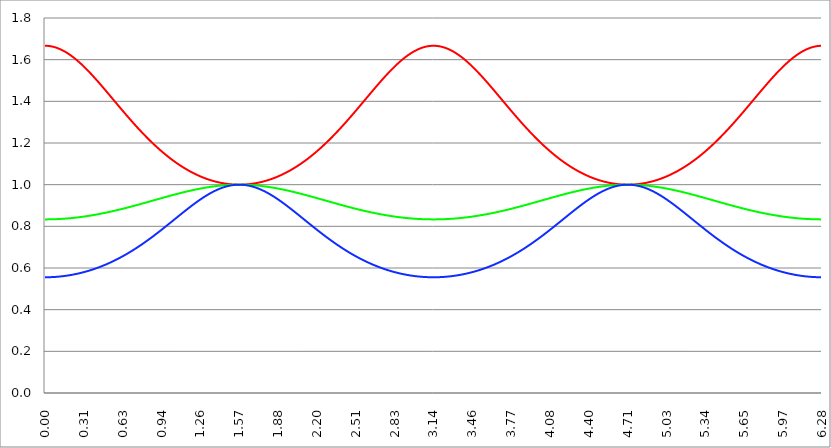
| Category | Series 1 | Series 0 | Series 2 |
|---|---|---|---|
| 0.0 | 1.667 | 0.833 | 0.556 |
| 0.00314159265358979 | 1.667 | 0.833 | 0.556 |
| 0.00628318530717958 | 1.667 | 0.833 | 0.556 |
| 0.00942477796076938 | 1.667 | 0.833 | 0.556 |
| 0.0125663706143592 | 1.666 | 0.833 | 0.556 |
| 0.015707963267949 | 1.666 | 0.833 | 0.556 |
| 0.0188495559215388 | 1.666 | 0.833 | 0.556 |
| 0.0219911485751285 | 1.666 | 0.833 | 0.556 |
| 0.0251327412287183 | 1.666 | 0.833 | 0.556 |
| 0.0282743338823081 | 1.666 | 0.833 | 0.556 |
| 0.0314159265358979 | 1.666 | 0.833 | 0.556 |
| 0.0345575191894877 | 1.665 | 0.833 | 0.556 |
| 0.0376991118430775 | 1.665 | 0.834 | 0.556 |
| 0.0408407044966673 | 1.665 | 0.834 | 0.556 |
| 0.0439822971502571 | 1.665 | 0.834 | 0.556 |
| 0.0471238898038469 | 1.664 | 0.834 | 0.556 |
| 0.0502654824574367 | 1.664 | 0.834 | 0.556 |
| 0.0534070751110265 | 1.664 | 0.834 | 0.556 |
| 0.0565486677646163 | 1.663 | 0.834 | 0.556 |
| 0.059690260418206 | 1.663 | 0.834 | 0.556 |
| 0.0628318530717958 | 1.662 | 0.834 | 0.557 |
| 0.0659734457253856 | 1.662 | 0.834 | 0.557 |
| 0.0691150383789754 | 1.661 | 0.834 | 0.557 |
| 0.0722566310325652 | 1.661 | 0.834 | 0.557 |
| 0.075398223686155 | 1.66 | 0.834 | 0.557 |
| 0.0785398163397448 | 1.66 | 0.834 | 0.557 |
| 0.0816814089933346 | 1.659 | 0.834 | 0.557 |
| 0.0848230016469244 | 1.659 | 0.834 | 0.557 |
| 0.0879645943005142 | 1.658 | 0.834 | 0.557 |
| 0.091106186954104 | 1.658 | 0.834 | 0.558 |
| 0.0942477796076937 | 1.657 | 0.835 | 0.558 |
| 0.0973893722612835 | 1.656 | 0.835 | 0.558 |
| 0.100530964914873 | 1.656 | 0.835 | 0.558 |
| 0.103672557568463 | 1.655 | 0.835 | 0.558 |
| 0.106814150222053 | 1.654 | 0.835 | 0.558 |
| 0.109955742875643 | 1.653 | 0.835 | 0.559 |
| 0.113097335529233 | 1.653 | 0.835 | 0.559 |
| 0.116238928182822 | 1.652 | 0.835 | 0.559 |
| 0.119380520836412 | 1.651 | 0.835 | 0.559 |
| 0.122522113490002 | 1.65 | 0.835 | 0.559 |
| 0.125663706143592 | 1.649 | 0.836 | 0.559 |
| 0.128805298797181 | 1.649 | 0.836 | 0.56 |
| 0.131946891450771 | 1.648 | 0.836 | 0.56 |
| 0.135088484104361 | 1.647 | 0.836 | 0.56 |
| 0.138230076757951 | 1.646 | 0.836 | 0.56 |
| 0.141371669411541 | 1.645 | 0.836 | 0.561 |
| 0.14451326206513 | 1.644 | 0.836 | 0.561 |
| 0.14765485471872 | 1.643 | 0.836 | 0.561 |
| 0.15079644737231 | 1.642 | 0.836 | 0.561 |
| 0.1539380400259 | 1.641 | 0.837 | 0.561 |
| 0.15707963267949 | 1.64 | 0.837 | 0.562 |
| 0.160221225333079 | 1.639 | 0.837 | 0.562 |
| 0.163362817986669 | 1.638 | 0.837 | 0.562 |
| 0.166504410640259 | 1.637 | 0.837 | 0.562 |
| 0.169646003293849 | 1.636 | 0.837 | 0.563 |
| 0.172787595947439 | 1.634 | 0.837 | 0.563 |
| 0.175929188601028 | 1.633 | 0.838 | 0.563 |
| 0.179070781254618 | 1.632 | 0.838 | 0.564 |
| 0.182212373908208 | 1.631 | 0.838 | 0.564 |
| 0.185353966561798 | 1.63 | 0.838 | 0.564 |
| 0.188495559215388 | 1.629 | 0.838 | 0.564 |
| 0.191637151868977 | 1.627 | 0.838 | 0.565 |
| 0.194778744522567 | 1.626 | 0.839 | 0.565 |
| 0.197920337176157 | 1.625 | 0.839 | 0.565 |
| 0.201061929829747 | 1.623 | 0.839 | 0.566 |
| 0.204203522483336 | 1.622 | 0.839 | 0.566 |
| 0.207345115136926 | 1.621 | 0.839 | 0.566 |
| 0.210486707790516 | 1.62 | 0.839 | 0.567 |
| 0.213628300444106 | 1.618 | 0.84 | 0.567 |
| 0.216769893097696 | 1.617 | 0.84 | 0.567 |
| 0.219911485751285 | 1.615 | 0.84 | 0.568 |
| 0.223053078404875 | 1.614 | 0.84 | 0.568 |
| 0.226194671058465 | 1.613 | 0.84 | 0.568 |
| 0.229336263712055 | 1.611 | 0.841 | 0.569 |
| 0.232477856365645 | 1.61 | 0.841 | 0.569 |
| 0.235619449019234 | 1.608 | 0.841 | 0.569 |
| 0.238761041672824 | 1.607 | 0.841 | 0.57 |
| 0.241902634326414 | 1.605 | 0.841 | 0.57 |
| 0.245044226980004 | 1.604 | 0.842 | 0.57 |
| 0.248185819633594 | 1.602 | 0.842 | 0.571 |
| 0.251327412287183 | 1.601 | 0.842 | 0.571 |
| 0.254469004940773 | 1.599 | 0.842 | 0.572 |
| 0.257610597594363 | 1.598 | 0.842 | 0.572 |
| 0.260752190247953 | 1.596 | 0.843 | 0.572 |
| 0.263893782901543 | 1.594 | 0.843 | 0.573 |
| 0.267035375555132 | 1.593 | 0.843 | 0.573 |
| 0.270176968208722 | 1.591 | 0.843 | 0.574 |
| 0.273318560862312 | 1.589 | 0.844 | 0.574 |
| 0.276460153515902 | 1.588 | 0.844 | 0.575 |
| 0.279601746169492 | 1.586 | 0.844 | 0.575 |
| 0.282743338823082 | 1.584 | 0.844 | 0.575 |
| 0.285884931476671 | 1.583 | 0.845 | 0.576 |
| 0.289026524130261 | 1.581 | 0.845 | 0.576 |
| 0.292168116783851 | 1.579 | 0.845 | 0.577 |
| 0.295309709437441 | 1.578 | 0.845 | 0.577 |
| 0.298451302091031 | 1.576 | 0.846 | 0.578 |
| 0.30159289474462 | 1.574 | 0.846 | 0.578 |
| 0.30473448739821 | 1.572 | 0.846 | 0.579 |
| 0.3078760800518 | 1.571 | 0.846 | 0.579 |
| 0.31101767270539 | 1.569 | 0.847 | 0.58 |
| 0.31415926535898 | 1.567 | 0.847 | 0.58 |
| 0.31730085801257 | 1.565 | 0.847 | 0.581 |
| 0.320442450666159 | 1.563 | 0.847 | 0.581 |
| 0.323584043319749 | 1.561 | 0.848 | 0.582 |
| 0.326725635973339 | 1.56 | 0.848 | 0.582 |
| 0.329867228626929 | 1.558 | 0.848 | 0.583 |
| 0.333008821280519 | 1.556 | 0.848 | 0.583 |
| 0.336150413934108 | 1.554 | 0.849 | 0.584 |
| 0.339292006587698 | 1.552 | 0.849 | 0.584 |
| 0.342433599241288 | 1.55 | 0.849 | 0.585 |
| 0.345575191894878 | 1.548 | 0.85 | 0.585 |
| 0.348716784548468 | 1.546 | 0.85 | 0.586 |
| 0.351858377202058 | 1.544 | 0.85 | 0.587 |
| 0.354999969855647 | 1.542 | 0.85 | 0.587 |
| 0.358141562509237 | 1.54 | 0.851 | 0.588 |
| 0.361283155162827 | 1.539 | 0.851 | 0.588 |
| 0.364424747816417 | 1.537 | 0.851 | 0.589 |
| 0.367566340470007 | 1.535 | 0.852 | 0.589 |
| 0.370707933123597 | 1.533 | 0.852 | 0.59 |
| 0.373849525777186 | 1.531 | 0.852 | 0.591 |
| 0.376991118430776 | 1.529 | 0.853 | 0.591 |
| 0.380132711084366 | 1.527 | 0.853 | 0.592 |
| 0.383274303737956 | 1.525 | 0.853 | 0.592 |
| 0.386415896391546 | 1.523 | 0.854 | 0.593 |
| 0.389557489045135 | 1.52 | 0.854 | 0.594 |
| 0.392699081698725 | 1.518 | 0.854 | 0.594 |
| 0.395840674352315 | 1.516 | 0.855 | 0.595 |
| 0.398982267005905 | 1.514 | 0.855 | 0.595 |
| 0.402123859659495 | 1.512 | 0.855 | 0.596 |
| 0.405265452313085 | 1.51 | 0.855 | 0.597 |
| 0.408407044966674 | 1.508 | 0.856 | 0.597 |
| 0.411548637620264 | 1.506 | 0.856 | 0.598 |
| 0.414690230273854 | 1.504 | 0.857 | 0.599 |
| 0.417831822927444 | 1.502 | 0.857 | 0.599 |
| 0.420973415581034 | 1.5 | 0.857 | 0.6 |
| 0.424115008234623 | 1.498 | 0.858 | 0.601 |
| 0.427256600888213 | 1.495 | 0.858 | 0.601 |
| 0.430398193541803 | 1.493 | 0.858 | 0.602 |
| 0.433539786195393 | 1.491 | 0.859 | 0.603 |
| 0.436681378848983 | 1.489 | 0.859 | 0.604 |
| 0.439822971502573 | 1.487 | 0.859 | 0.604 |
| 0.442964564156162 | 1.485 | 0.86 | 0.605 |
| 0.446106156809752 | 1.483 | 0.86 | 0.606 |
| 0.449247749463342 | 1.481 | 0.86 | 0.606 |
| 0.452389342116932 | 1.478 | 0.861 | 0.607 |
| 0.455530934770522 | 1.476 | 0.861 | 0.608 |
| 0.458672527424111 | 1.474 | 0.861 | 0.609 |
| 0.461814120077701 | 1.472 | 0.862 | 0.609 |
| 0.464955712731291 | 1.47 | 0.862 | 0.61 |
| 0.468097305384881 | 1.468 | 0.863 | 0.611 |
| 0.471238898038471 | 1.465 | 0.863 | 0.612 |
| 0.474380490692061 | 1.463 | 0.863 | 0.612 |
| 0.47752208334565 | 1.461 | 0.864 | 0.613 |
| 0.48066367599924 | 1.459 | 0.864 | 0.614 |
| 0.48380526865283 | 1.457 | 0.865 | 0.615 |
| 0.48694686130642 | 1.454 | 0.865 | 0.615 |
| 0.49008845396001 | 1.452 | 0.865 | 0.616 |
| 0.493230046613599 | 1.45 | 0.866 | 0.617 |
| 0.496371639267189 | 1.448 | 0.866 | 0.618 |
| 0.499513231920779 | 1.446 | 0.866 | 0.619 |
| 0.502654824574369 | 1.443 | 0.867 | 0.619 |
| 0.505796417227959 | 1.441 | 0.867 | 0.62 |
| 0.508938009881549 | 1.439 | 0.868 | 0.621 |
| 0.512079602535138 | 1.437 | 0.868 | 0.622 |
| 0.515221195188728 | 1.434 | 0.868 | 0.623 |
| 0.518362787842318 | 1.432 | 0.869 | 0.624 |
| 0.521504380495908 | 1.43 | 0.869 | 0.624 |
| 0.524645973149498 | 1.428 | 0.87 | 0.625 |
| 0.527787565803087 | 1.426 | 0.87 | 0.626 |
| 0.530929158456677 | 1.423 | 0.871 | 0.627 |
| 0.534070751110267 | 1.421 | 0.871 | 0.628 |
| 0.537212343763857 | 1.419 | 0.871 | 0.629 |
| 0.540353936417447 | 1.417 | 0.872 | 0.63 |
| 0.543495529071037 | 1.414 | 0.872 | 0.63 |
| 0.546637121724626 | 1.412 | 0.873 | 0.631 |
| 0.549778714378216 | 1.41 | 0.873 | 0.632 |
| 0.552920307031806 | 1.408 | 0.873 | 0.633 |
| 0.556061899685396 | 1.406 | 0.874 | 0.634 |
| 0.559203492338986 | 1.403 | 0.874 | 0.635 |
| 0.562345084992576 | 1.401 | 0.875 | 0.636 |
| 0.565486677646165 | 1.399 | 0.875 | 0.637 |
| 0.568628270299755 | 1.397 | 0.876 | 0.638 |
| 0.571769862953345 | 1.394 | 0.876 | 0.639 |
| 0.574911455606935 | 1.392 | 0.877 | 0.64 |
| 0.578053048260525 | 1.39 | 0.877 | 0.641 |
| 0.581194640914114 | 1.388 | 0.877 | 0.641 |
| 0.584336233567704 | 1.386 | 0.878 | 0.642 |
| 0.587477826221294 | 1.383 | 0.878 | 0.643 |
| 0.590619418874884 | 1.381 | 0.879 | 0.644 |
| 0.593761011528474 | 1.379 | 0.879 | 0.645 |
| 0.596902604182064 | 1.377 | 0.88 | 0.646 |
| 0.600044196835653 | 1.374 | 0.88 | 0.647 |
| 0.603185789489243 | 1.372 | 0.881 | 0.648 |
| 0.606327382142833 | 1.37 | 0.881 | 0.649 |
| 0.609468974796423 | 1.368 | 0.881 | 0.65 |
| 0.612610567450013 | 1.366 | 0.882 | 0.651 |
| 0.615752160103602 | 1.363 | 0.882 | 0.652 |
| 0.618893752757192 | 1.361 | 0.883 | 0.653 |
| 0.622035345410782 | 1.359 | 0.883 | 0.654 |
| 0.625176938064372 | 1.357 | 0.884 | 0.655 |
| 0.628318530717962 | 1.355 | 0.884 | 0.656 |
| 0.631460123371551 | 1.352 | 0.885 | 0.657 |
| 0.634601716025141 | 1.35 | 0.885 | 0.658 |
| 0.637743308678731 | 1.348 | 0.886 | 0.659 |
| 0.640884901332321 | 1.346 | 0.886 | 0.66 |
| 0.644026493985911 | 1.344 | 0.887 | 0.662 |
| 0.647168086639501 | 1.342 | 0.887 | 0.663 |
| 0.65030967929309 | 1.339 | 0.888 | 0.664 |
| 0.65345127194668 | 1.337 | 0.888 | 0.665 |
| 0.65659286460027 | 1.335 | 0.889 | 0.666 |
| 0.65973445725386 | 1.333 | 0.889 | 0.667 |
| 0.66287604990745 | 1.331 | 0.889 | 0.668 |
| 0.666017642561039 | 1.329 | 0.89 | 0.669 |
| 0.669159235214629 | 1.326 | 0.89 | 0.67 |
| 0.672300827868219 | 1.324 | 0.891 | 0.671 |
| 0.675442420521809 | 1.322 | 0.891 | 0.672 |
| 0.678584013175399 | 1.32 | 0.892 | 0.673 |
| 0.681725605828989 | 1.318 | 0.892 | 0.675 |
| 0.684867198482578 | 1.316 | 0.893 | 0.676 |
| 0.688008791136168 | 1.314 | 0.893 | 0.677 |
| 0.691150383789758 | 1.311 | 0.894 | 0.678 |
| 0.694291976443348 | 1.309 | 0.894 | 0.679 |
| 0.697433569096938 | 1.307 | 0.895 | 0.68 |
| 0.700575161750528 | 1.305 | 0.895 | 0.681 |
| 0.703716754404117 | 1.303 | 0.896 | 0.683 |
| 0.706858347057707 | 1.301 | 0.896 | 0.684 |
| 0.709999939711297 | 1.299 | 0.897 | 0.685 |
| 0.713141532364887 | 1.297 | 0.897 | 0.686 |
| 0.716283125018477 | 1.295 | 0.898 | 0.687 |
| 0.719424717672066 | 1.293 | 0.898 | 0.688 |
| 0.722566310325656 | 1.29 | 0.899 | 0.69 |
| 0.725707902979246 | 1.288 | 0.899 | 0.691 |
| 0.728849495632836 | 1.286 | 0.9 | 0.692 |
| 0.731991088286426 | 1.284 | 0.9 | 0.693 |
| 0.735132680940016 | 1.282 | 0.901 | 0.694 |
| 0.738274273593605 | 1.28 | 0.901 | 0.696 |
| 0.741415866247195 | 1.278 | 0.902 | 0.697 |
| 0.744557458900785 | 1.276 | 0.902 | 0.698 |
| 0.747699051554375 | 1.274 | 0.903 | 0.699 |
| 0.750840644207965 | 1.272 | 0.903 | 0.7 |
| 0.753982236861554 | 1.27 | 0.904 | 0.702 |
| 0.757123829515144 | 1.268 | 0.904 | 0.703 |
| 0.760265422168734 | 1.266 | 0.905 | 0.704 |
| 0.763407014822324 | 1.264 | 0.905 | 0.705 |
| 0.766548607475914 | 1.262 | 0.906 | 0.707 |
| 0.769690200129504 | 1.26 | 0.907 | 0.708 |
| 0.772831792783093 | 1.258 | 0.907 | 0.709 |
| 0.775973385436683 | 1.256 | 0.908 | 0.71 |
| 0.779114978090273 | 1.254 | 0.908 | 0.712 |
| 0.782256570743863 | 1.252 | 0.909 | 0.713 |
| 0.785398163397453 | 1.25 | 0.909 | 0.714 |
| 0.788539756051042 | 1.248 | 0.91 | 0.716 |
| 0.791681348704632 | 1.246 | 0.91 | 0.717 |
| 0.794822941358222 | 1.244 | 0.911 | 0.718 |
| 0.797964534011812 | 1.242 | 0.911 | 0.719 |
| 0.801106126665402 | 1.24 | 0.912 | 0.721 |
| 0.804247719318992 | 1.238 | 0.912 | 0.722 |
| 0.807389311972581 | 1.236 | 0.913 | 0.723 |
| 0.810530904626171 | 1.234 | 0.913 | 0.725 |
| 0.813672497279761 | 1.233 | 0.914 | 0.726 |
| 0.816814089933351 | 1.231 | 0.914 | 0.727 |
| 0.819955682586941 | 1.229 | 0.915 | 0.729 |
| 0.823097275240531 | 1.227 | 0.915 | 0.73 |
| 0.82623886789412 | 1.225 | 0.916 | 0.731 |
| 0.82938046054771 | 1.223 | 0.916 | 0.733 |
| 0.8325220532013 | 1.221 | 0.917 | 0.734 |
| 0.83566364585489 | 1.219 | 0.917 | 0.735 |
| 0.83880523850848 | 1.218 | 0.918 | 0.737 |
| 0.841946831162069 | 1.216 | 0.919 | 0.738 |
| 0.845088423815659 | 1.214 | 0.919 | 0.739 |
| 0.848230016469249 | 1.212 | 0.92 | 0.741 |
| 0.851371609122839 | 1.21 | 0.92 | 0.742 |
| 0.854513201776429 | 1.208 | 0.921 | 0.744 |
| 0.857654794430019 | 1.207 | 0.921 | 0.745 |
| 0.860796387083608 | 1.205 | 0.922 | 0.746 |
| 0.863937979737198 | 1.203 | 0.922 | 0.748 |
| 0.867079572390788 | 1.201 | 0.923 | 0.749 |
| 0.870221165044378 | 1.199 | 0.923 | 0.75 |
| 0.873362757697968 | 1.198 | 0.924 | 0.752 |
| 0.876504350351557 | 1.196 | 0.924 | 0.753 |
| 0.879645943005147 | 1.194 | 0.925 | 0.755 |
| 0.882787535658737 | 1.192 | 0.925 | 0.756 |
| 0.885929128312327 | 1.191 | 0.926 | 0.758 |
| 0.889070720965917 | 1.189 | 0.926 | 0.759 |
| 0.892212313619507 | 1.187 | 0.927 | 0.76 |
| 0.895353906273096 | 1.185 | 0.927 | 0.762 |
| 0.898495498926686 | 1.184 | 0.928 | 0.763 |
| 0.901637091580276 | 1.182 | 0.929 | 0.765 |
| 0.904778684233866 | 1.18 | 0.929 | 0.766 |
| 0.907920276887456 | 1.179 | 0.93 | 0.767 |
| 0.911061869541045 | 1.177 | 0.93 | 0.769 |
| 0.914203462194635 | 1.175 | 0.931 | 0.77 |
| 0.917345054848225 | 1.173 | 0.931 | 0.772 |
| 0.920486647501815 | 1.172 | 0.932 | 0.773 |
| 0.923628240155405 | 1.17 | 0.932 | 0.775 |
| 0.926769832808995 | 1.168 | 0.933 | 0.776 |
| 0.929911425462584 | 1.167 | 0.933 | 0.778 |
| 0.933053018116174 | 1.165 | 0.934 | 0.779 |
| 0.936194610769764 | 1.164 | 0.934 | 0.781 |
| 0.939336203423354 | 1.162 | 0.935 | 0.782 |
| 0.942477796076944 | 1.16 | 0.935 | 0.783 |
| 0.945619388730533 | 1.159 | 0.936 | 0.785 |
| 0.948760981384123 | 1.157 | 0.936 | 0.786 |
| 0.951902574037713 | 1.156 | 0.937 | 0.788 |
| 0.955044166691303 | 1.154 | 0.937 | 0.789 |
| 0.958185759344893 | 1.152 | 0.938 | 0.791 |
| 0.961327351998483 | 1.151 | 0.938 | 0.792 |
| 0.964468944652072 | 1.149 | 0.939 | 0.794 |
| 0.967610537305662 | 1.148 | 0.94 | 0.795 |
| 0.970752129959252 | 1.146 | 0.94 | 0.797 |
| 0.973893722612842 | 1.145 | 0.941 | 0.798 |
| 0.977035315266432 | 1.143 | 0.941 | 0.8 |
| 0.980176907920022 | 1.142 | 0.942 | 0.801 |
| 0.983318500573611 | 1.14 | 0.942 | 0.803 |
| 0.986460093227201 | 1.139 | 0.943 | 0.804 |
| 0.989601685880791 | 1.137 | 0.943 | 0.806 |
| 0.992743278534381 | 1.136 | 0.944 | 0.807 |
| 0.995884871187971 | 1.134 | 0.944 | 0.809 |
| 0.99902646384156 | 1.133 | 0.945 | 0.81 |
| 1.00216805649515 | 1.131 | 0.945 | 0.812 |
| 1.00530964914874 | 1.13 | 0.946 | 0.813 |
| 1.00845124180233 | 1.128 | 0.946 | 0.815 |
| 1.01159283445592 | 1.127 | 0.947 | 0.816 |
| 1.01473442710951 | 1.125 | 0.947 | 0.818 |
| 1.017876019763099 | 1.124 | 0.948 | 0.819 |
| 1.021017612416689 | 1.123 | 0.948 | 0.821 |
| 1.02415920507028 | 1.121 | 0.949 | 0.822 |
| 1.027300797723869 | 1.12 | 0.949 | 0.824 |
| 1.030442390377459 | 1.118 | 0.95 | 0.825 |
| 1.033583983031048 | 1.117 | 0.95 | 0.827 |
| 1.036725575684638 | 1.116 | 0.951 | 0.828 |
| 1.039867168338228 | 1.114 | 0.951 | 0.83 |
| 1.043008760991818 | 1.113 | 0.952 | 0.831 |
| 1.046150353645408 | 1.112 | 0.952 | 0.833 |
| 1.049291946298998 | 1.11 | 0.953 | 0.834 |
| 1.052433538952587 | 1.109 | 0.953 | 0.836 |
| 1.055575131606177 | 1.108 | 0.954 | 0.837 |
| 1.058716724259767 | 1.106 | 0.954 | 0.839 |
| 1.061858316913357 | 1.105 | 0.955 | 0.84 |
| 1.064999909566947 | 1.104 | 0.955 | 0.842 |
| 1.068141502220536 | 1.102 | 0.956 | 0.843 |
| 1.071283094874126 | 1.101 | 0.956 | 0.845 |
| 1.074424687527716 | 1.1 | 0.957 | 0.846 |
| 1.077566280181306 | 1.099 | 0.957 | 0.848 |
| 1.080707872834896 | 1.097 | 0.958 | 0.849 |
| 1.083849465488486 | 1.096 | 0.958 | 0.851 |
| 1.086991058142075 | 1.095 | 0.959 | 0.852 |
| 1.090132650795665 | 1.094 | 0.959 | 0.854 |
| 1.093274243449255 | 1.092 | 0.959 | 0.855 |
| 1.096415836102845 | 1.091 | 0.96 | 0.857 |
| 1.099557428756435 | 1.09 | 0.96 | 0.858 |
| 1.102699021410025 | 1.089 | 0.961 | 0.86 |
| 1.105840614063614 | 1.087 | 0.961 | 0.861 |
| 1.108982206717204 | 1.086 | 0.962 | 0.863 |
| 1.112123799370794 | 1.085 | 0.962 | 0.864 |
| 1.115265392024384 | 1.084 | 0.963 | 0.866 |
| 1.118406984677974 | 1.083 | 0.963 | 0.867 |
| 1.121548577331563 | 1.082 | 0.964 | 0.869 |
| 1.124690169985153 | 1.08 | 0.964 | 0.87 |
| 1.127831762638743 | 1.079 | 0.965 | 0.872 |
| 1.130973355292333 | 1.078 | 0.965 | 0.873 |
| 1.134114947945923 | 1.077 | 0.965 | 0.875 |
| 1.137256540599513 | 1.076 | 0.966 | 0.876 |
| 1.140398133253102 | 1.075 | 0.966 | 0.878 |
| 1.143539725906692 | 1.074 | 0.967 | 0.879 |
| 1.146681318560282 | 1.073 | 0.967 | 0.881 |
| 1.149822911213872 | 1.072 | 0.968 | 0.882 |
| 1.152964503867462 | 1.071 | 0.968 | 0.884 |
| 1.156106096521051 | 1.069 | 0.969 | 0.885 |
| 1.159247689174641 | 1.068 | 0.969 | 0.887 |
| 1.162389281828231 | 1.067 | 0.969 | 0.888 |
| 1.165530874481821 | 1.066 | 0.97 | 0.889 |
| 1.168672467135411 | 1.065 | 0.97 | 0.891 |
| 1.171814059789001 | 1.064 | 0.971 | 0.892 |
| 1.17495565244259 | 1.063 | 0.971 | 0.894 |
| 1.17809724509618 | 1.062 | 0.972 | 0.895 |
| 1.18123883774977 | 1.061 | 0.972 | 0.897 |
| 1.18438043040336 | 1.06 | 0.972 | 0.898 |
| 1.18752202305695 | 1.059 | 0.973 | 0.899 |
| 1.190663615710539 | 1.058 | 0.973 | 0.901 |
| 1.193805208364129 | 1.057 | 0.974 | 0.902 |
| 1.19694680101772 | 1.056 | 0.974 | 0.904 |
| 1.200088393671309 | 1.055 | 0.974 | 0.905 |
| 1.203229986324899 | 1.054 | 0.975 | 0.906 |
| 1.206371578978489 | 1.054 | 0.975 | 0.908 |
| 1.209513171632078 | 1.053 | 0.976 | 0.909 |
| 1.212654764285668 | 1.052 | 0.976 | 0.91 |
| 1.215796356939258 | 1.051 | 0.976 | 0.912 |
| 1.218937949592848 | 1.05 | 0.977 | 0.913 |
| 1.222079542246438 | 1.049 | 0.977 | 0.915 |
| 1.225221134900027 | 1.048 | 0.978 | 0.916 |
| 1.228362727553617 | 1.047 | 0.978 | 0.917 |
| 1.231504320207207 | 1.046 | 0.978 | 0.919 |
| 1.234645912860797 | 1.046 | 0.979 | 0.92 |
| 1.237787505514387 | 1.045 | 0.979 | 0.921 |
| 1.240929098167977 | 1.044 | 0.979 | 0.923 |
| 1.244070690821566 | 1.043 | 0.98 | 0.924 |
| 1.247212283475156 | 1.042 | 0.98 | 0.925 |
| 1.250353876128746 | 1.041 | 0.981 | 0.926 |
| 1.253495468782336 | 1.041 | 0.981 | 0.928 |
| 1.256637061435926 | 1.04 | 0.981 | 0.929 |
| 1.259778654089515 | 1.039 | 0.982 | 0.93 |
| 1.262920246743105 | 1.038 | 0.982 | 0.932 |
| 1.266061839396695 | 1.037 | 0.982 | 0.933 |
| 1.269203432050285 | 1.037 | 0.983 | 0.934 |
| 1.272345024703875 | 1.036 | 0.983 | 0.935 |
| 1.275486617357465 | 1.035 | 0.983 | 0.937 |
| 1.278628210011054 | 1.034 | 0.984 | 0.938 |
| 1.281769802664644 | 1.034 | 0.984 | 0.939 |
| 1.284911395318234 | 1.033 | 0.984 | 0.94 |
| 1.288052987971824 | 1.032 | 0.985 | 0.941 |
| 1.291194580625414 | 1.031 | 0.985 | 0.943 |
| 1.294336173279003 | 1.031 | 0.985 | 0.944 |
| 1.297477765932593 | 1.03 | 0.986 | 0.945 |
| 1.300619358586183 | 1.029 | 0.986 | 0.946 |
| 1.303760951239773 | 1.029 | 0.986 | 0.947 |
| 1.306902543893363 | 1.028 | 0.987 | 0.948 |
| 1.310044136546953 | 1.027 | 0.987 | 0.95 |
| 1.313185729200542 | 1.027 | 0.987 | 0.951 |
| 1.316327321854132 | 1.026 | 0.987 | 0.952 |
| 1.319468914507722 | 1.025 | 0.988 | 0.953 |
| 1.322610507161312 | 1.025 | 0.988 | 0.954 |
| 1.325752099814902 | 1.024 | 0.988 | 0.955 |
| 1.328893692468491 | 1.023 | 0.989 | 0.956 |
| 1.332035285122081 | 1.023 | 0.989 | 0.957 |
| 1.335176877775671 | 1.022 | 0.989 | 0.958 |
| 1.338318470429261 | 1.022 | 0.989 | 0.959 |
| 1.341460063082851 | 1.021 | 0.99 | 0.96 |
| 1.344601655736441 | 1.021 | 0.99 | 0.961 |
| 1.34774324839003 | 1.02 | 0.99 | 0.962 |
| 1.35088484104362 | 1.019 | 0.991 | 0.963 |
| 1.35402643369721 | 1.019 | 0.991 | 0.964 |
| 1.3571680263508 | 1.018 | 0.991 | 0.965 |
| 1.36030961900439 | 1.018 | 0.991 | 0.966 |
| 1.363451211657979 | 1.017 | 0.992 | 0.967 |
| 1.36659280431157 | 1.017 | 0.992 | 0.968 |
| 1.369734396965159 | 1.016 | 0.992 | 0.969 |
| 1.372875989618749 | 1.016 | 0.992 | 0.97 |
| 1.376017582272339 | 1.015 | 0.993 | 0.971 |
| 1.379159174925929 | 1.015 | 0.993 | 0.972 |
| 1.382300767579518 | 1.014 | 0.993 | 0.973 |
| 1.385442360233108 | 1.014 | 0.993 | 0.974 |
| 1.388583952886698 | 1.013 | 0.993 | 0.974 |
| 1.391725545540288 | 1.013 | 0.994 | 0.975 |
| 1.394867138193878 | 1.012 | 0.994 | 0.976 |
| 1.398008730847468 | 1.012 | 0.994 | 0.977 |
| 1.401150323501057 | 1.012 | 0.994 | 0.978 |
| 1.404291916154647 | 1.011 | 0.995 | 0.978 |
| 1.407433508808237 | 1.011 | 0.995 | 0.979 |
| 1.410575101461827 | 1.01 | 0.995 | 0.98 |
| 1.413716694115417 | 1.01 | 0.995 | 0.981 |
| 1.416858286769006 | 1.009 | 0.995 | 0.982 |
| 1.419999879422596 | 1.009 | 0.996 | 0.982 |
| 1.423141472076186 | 1.009 | 0.996 | 0.983 |
| 1.426283064729776 | 1.008 | 0.996 | 0.984 |
| 1.429424657383366 | 1.008 | 0.996 | 0.984 |
| 1.432566250036956 | 1.008 | 0.996 | 0.985 |
| 1.435707842690545 | 1.007 | 0.996 | 0.986 |
| 1.438849435344135 | 1.007 | 0.997 | 0.986 |
| 1.441991027997725 | 1.007 | 0.997 | 0.987 |
| 1.445132620651315 | 1.006 | 0.997 | 0.988 |
| 1.448274213304905 | 1.006 | 0.997 | 0.988 |
| 1.451415805958494 | 1.006 | 0.997 | 0.989 |
| 1.454557398612084 | 1.005 | 0.997 | 0.989 |
| 1.457698991265674 | 1.005 | 0.997 | 0.99 |
| 1.460840583919264 | 1.005 | 0.998 | 0.99 |
| 1.463982176572854 | 1.005 | 0.998 | 0.991 |
| 1.467123769226444 | 1.004 | 0.998 | 0.992 |
| 1.470265361880033 | 1.004 | 0.998 | 0.992 |
| 1.473406954533623 | 1.004 | 0.998 | 0.992 |
| 1.476548547187213 | 1.004 | 0.998 | 0.993 |
| 1.479690139840803 | 1.003 | 0.998 | 0.993 |
| 1.482831732494393 | 1.003 | 0.998 | 0.994 |
| 1.485973325147982 | 1.003 | 0.999 | 0.994 |
| 1.489114917801572 | 1.003 | 0.999 | 0.995 |
| 1.492256510455162 | 1.002 | 0.999 | 0.995 |
| 1.495398103108752 | 1.002 | 0.999 | 0.995 |
| 1.498539695762342 | 1.002 | 0.999 | 0.996 |
| 1.501681288415932 | 1.002 | 0.999 | 0.996 |
| 1.504822881069521 | 1.002 | 0.999 | 0.997 |
| 1.507964473723111 | 1.002 | 0.999 | 0.997 |
| 1.511106066376701 | 1.001 | 0.999 | 0.997 |
| 1.514247659030291 | 1.001 | 0.999 | 0.997 |
| 1.517389251683881 | 1.001 | 0.999 | 0.998 |
| 1.520530844337471 | 1.001 | 0.999 | 0.998 |
| 1.52367243699106 | 1.001 | 1 | 0.998 |
| 1.52681402964465 | 1.001 | 1 | 0.998 |
| 1.52995562229824 | 1.001 | 1 | 0.999 |
| 1.53309721495183 | 1.001 | 1 | 0.999 |
| 1.53623880760542 | 1 | 1 | 0.999 |
| 1.539380400259009 | 1 | 1 | 0.999 |
| 1.542521992912599 | 1 | 1 | 0.999 |
| 1.545663585566189 | 1 | 1 | 0.999 |
| 1.548805178219779 | 1 | 1 | 1 |
| 1.551946770873369 | 1 | 1 | 1 |
| 1.555088363526959 | 1 | 1 | 1 |
| 1.558229956180548 | 1 | 1 | 1 |
| 1.561371548834138 | 1 | 1 | 1 |
| 1.564513141487728 | 1 | 1 | 1 |
| 1.567654734141318 | 1 | 1 | 1 |
| 1.570796326794908 | 1 | 1 | 1 |
| 1.573937919448497 | 1 | 1 | 1 |
| 1.577079512102087 | 1 | 1 | 1 |
| 1.580221104755677 | 1 | 1 | 1 |
| 1.583362697409267 | 1 | 1 | 1 |
| 1.586504290062857 | 1 | 1 | 1 |
| 1.589645882716447 | 1 | 1 | 1 |
| 1.592787475370036 | 1 | 1 | 1 |
| 1.595929068023626 | 1 | 1 | 0.999 |
| 1.599070660677216 | 1 | 1 | 0.999 |
| 1.602212253330806 | 1 | 1 | 0.999 |
| 1.605353845984396 | 1 | 1 | 0.999 |
| 1.608495438637985 | 1.001 | 1 | 0.999 |
| 1.611637031291575 | 1.001 | 1 | 0.999 |
| 1.614778623945165 | 1.001 | 1 | 0.998 |
| 1.617920216598755 | 1.001 | 1 | 0.998 |
| 1.621061809252345 | 1.001 | 0.999 | 0.998 |
| 1.624203401905935 | 1.001 | 0.999 | 0.998 |
| 1.627344994559524 | 1.001 | 0.999 | 0.997 |
| 1.630486587213114 | 1.001 | 0.999 | 0.997 |
| 1.633628179866704 | 1.002 | 0.999 | 0.997 |
| 1.636769772520294 | 1.002 | 0.999 | 0.997 |
| 1.639911365173884 | 1.002 | 0.999 | 0.996 |
| 1.643052957827473 | 1.002 | 0.999 | 0.996 |
| 1.646194550481063 | 1.002 | 0.999 | 0.995 |
| 1.649336143134653 | 1.002 | 0.999 | 0.995 |
| 1.652477735788243 | 1.003 | 0.999 | 0.995 |
| 1.655619328441833 | 1.003 | 0.999 | 0.994 |
| 1.658760921095423 | 1.003 | 0.998 | 0.994 |
| 1.661902513749012 | 1.003 | 0.998 | 0.993 |
| 1.665044106402602 | 1.004 | 0.998 | 0.993 |
| 1.668185699056192 | 1.004 | 0.998 | 0.992 |
| 1.671327291709782 | 1.004 | 0.998 | 0.992 |
| 1.674468884363372 | 1.004 | 0.998 | 0.992 |
| 1.677610477016961 | 1.005 | 0.998 | 0.991 |
| 1.680752069670551 | 1.005 | 0.998 | 0.99 |
| 1.683893662324141 | 1.005 | 0.997 | 0.99 |
| 1.687035254977731 | 1.005 | 0.997 | 0.989 |
| 1.690176847631321 | 1.006 | 0.997 | 0.989 |
| 1.693318440284911 | 1.006 | 0.997 | 0.988 |
| 1.6964600329385 | 1.006 | 0.997 | 0.988 |
| 1.69960162559209 | 1.007 | 0.997 | 0.987 |
| 1.70274321824568 | 1.007 | 0.997 | 0.986 |
| 1.70588481089927 | 1.007 | 0.996 | 0.986 |
| 1.70902640355286 | 1.008 | 0.996 | 0.985 |
| 1.712167996206449 | 1.008 | 0.996 | 0.984 |
| 1.715309588860039 | 1.008 | 0.996 | 0.984 |
| 1.71845118151363 | 1.009 | 0.996 | 0.983 |
| 1.721592774167219 | 1.009 | 0.996 | 0.982 |
| 1.724734366820809 | 1.009 | 0.995 | 0.982 |
| 1.727875959474399 | 1.01 | 0.995 | 0.981 |
| 1.731017552127988 | 1.01 | 0.995 | 0.98 |
| 1.734159144781578 | 1.011 | 0.995 | 0.979 |
| 1.737300737435168 | 1.011 | 0.995 | 0.978 |
| 1.740442330088758 | 1.012 | 0.994 | 0.978 |
| 1.743583922742348 | 1.012 | 0.994 | 0.977 |
| 1.746725515395937 | 1.012 | 0.994 | 0.976 |
| 1.749867108049527 | 1.013 | 0.994 | 0.975 |
| 1.753008700703117 | 1.013 | 0.993 | 0.974 |
| 1.756150293356707 | 1.014 | 0.993 | 0.974 |
| 1.759291886010297 | 1.014 | 0.993 | 0.973 |
| 1.762433478663887 | 1.015 | 0.993 | 0.972 |
| 1.765575071317476 | 1.015 | 0.993 | 0.971 |
| 1.768716663971066 | 1.016 | 0.992 | 0.97 |
| 1.771858256624656 | 1.016 | 0.992 | 0.969 |
| 1.774999849278246 | 1.017 | 0.992 | 0.968 |
| 1.778141441931836 | 1.017 | 0.992 | 0.967 |
| 1.781283034585426 | 1.018 | 0.991 | 0.966 |
| 1.784424627239015 | 1.018 | 0.991 | 0.965 |
| 1.787566219892605 | 1.019 | 0.991 | 0.964 |
| 1.790707812546195 | 1.019 | 0.991 | 0.963 |
| 1.793849405199785 | 1.02 | 0.99 | 0.962 |
| 1.796990997853375 | 1.021 | 0.99 | 0.961 |
| 1.800132590506964 | 1.021 | 0.99 | 0.96 |
| 1.803274183160554 | 1.022 | 0.989 | 0.959 |
| 1.806415775814144 | 1.022 | 0.989 | 0.958 |
| 1.809557368467734 | 1.023 | 0.989 | 0.957 |
| 1.812698961121324 | 1.023 | 0.989 | 0.956 |
| 1.815840553774914 | 1.024 | 0.988 | 0.955 |
| 1.818982146428503 | 1.025 | 0.988 | 0.954 |
| 1.822123739082093 | 1.025 | 0.988 | 0.953 |
| 1.825265331735683 | 1.026 | 0.987 | 0.952 |
| 1.828406924389273 | 1.027 | 0.987 | 0.951 |
| 1.831548517042863 | 1.027 | 0.987 | 0.95 |
| 1.834690109696452 | 1.028 | 0.987 | 0.948 |
| 1.837831702350042 | 1.029 | 0.986 | 0.947 |
| 1.840973295003632 | 1.029 | 0.986 | 0.946 |
| 1.844114887657222 | 1.03 | 0.986 | 0.945 |
| 1.847256480310812 | 1.031 | 0.985 | 0.944 |
| 1.850398072964402 | 1.031 | 0.985 | 0.943 |
| 1.853539665617991 | 1.032 | 0.985 | 0.941 |
| 1.856681258271581 | 1.033 | 0.984 | 0.94 |
| 1.859822850925171 | 1.034 | 0.984 | 0.939 |
| 1.862964443578761 | 1.034 | 0.984 | 0.938 |
| 1.866106036232351 | 1.035 | 0.983 | 0.937 |
| 1.86924762888594 | 1.036 | 0.983 | 0.935 |
| 1.87238922153953 | 1.037 | 0.983 | 0.934 |
| 1.87553081419312 | 1.037 | 0.982 | 0.933 |
| 1.87867240684671 | 1.038 | 0.982 | 0.932 |
| 1.8818139995003 | 1.039 | 0.982 | 0.93 |
| 1.88495559215389 | 1.04 | 0.981 | 0.929 |
| 1.888097184807479 | 1.041 | 0.981 | 0.928 |
| 1.891238777461069 | 1.041 | 0.981 | 0.926 |
| 1.89438037011466 | 1.042 | 0.98 | 0.925 |
| 1.897521962768249 | 1.043 | 0.98 | 0.924 |
| 1.900663555421839 | 1.044 | 0.979 | 0.923 |
| 1.903805148075429 | 1.045 | 0.979 | 0.921 |
| 1.906946740729018 | 1.046 | 0.979 | 0.92 |
| 1.910088333382608 | 1.046 | 0.978 | 0.919 |
| 1.913229926036198 | 1.047 | 0.978 | 0.917 |
| 1.916371518689788 | 1.048 | 0.978 | 0.916 |
| 1.919513111343378 | 1.049 | 0.977 | 0.915 |
| 1.922654703996967 | 1.05 | 0.977 | 0.913 |
| 1.925796296650557 | 1.051 | 0.976 | 0.912 |
| 1.928937889304147 | 1.052 | 0.976 | 0.91 |
| 1.932079481957737 | 1.053 | 0.976 | 0.909 |
| 1.935221074611327 | 1.054 | 0.975 | 0.908 |
| 1.938362667264917 | 1.054 | 0.975 | 0.906 |
| 1.941504259918506 | 1.055 | 0.974 | 0.905 |
| 1.944645852572096 | 1.056 | 0.974 | 0.904 |
| 1.947787445225686 | 1.057 | 0.974 | 0.902 |
| 1.950929037879276 | 1.058 | 0.973 | 0.901 |
| 1.954070630532866 | 1.059 | 0.973 | 0.899 |
| 1.957212223186455 | 1.06 | 0.972 | 0.898 |
| 1.960353815840045 | 1.061 | 0.972 | 0.897 |
| 1.963495408493635 | 1.062 | 0.972 | 0.895 |
| 1.966637001147225 | 1.063 | 0.971 | 0.894 |
| 1.969778593800815 | 1.064 | 0.971 | 0.892 |
| 1.972920186454405 | 1.065 | 0.97 | 0.891 |
| 1.976061779107994 | 1.066 | 0.97 | 0.889 |
| 1.979203371761584 | 1.067 | 0.969 | 0.888 |
| 1.982344964415174 | 1.068 | 0.969 | 0.887 |
| 1.985486557068764 | 1.069 | 0.969 | 0.885 |
| 1.988628149722354 | 1.071 | 0.968 | 0.884 |
| 1.991769742375943 | 1.072 | 0.968 | 0.882 |
| 1.994911335029533 | 1.073 | 0.967 | 0.881 |
| 1.998052927683123 | 1.074 | 0.967 | 0.879 |
| 2.001194520336712 | 1.075 | 0.966 | 0.878 |
| 2.004336112990302 | 1.076 | 0.966 | 0.876 |
| 2.007477705643892 | 1.077 | 0.965 | 0.875 |
| 2.010619298297482 | 1.078 | 0.965 | 0.873 |
| 2.013760890951071 | 1.079 | 0.965 | 0.872 |
| 2.016902483604661 | 1.08 | 0.964 | 0.87 |
| 2.02004407625825 | 1.082 | 0.964 | 0.869 |
| 2.02318566891184 | 1.083 | 0.963 | 0.867 |
| 2.02632726156543 | 1.084 | 0.963 | 0.866 |
| 2.029468854219019 | 1.085 | 0.962 | 0.864 |
| 2.032610446872609 | 1.086 | 0.962 | 0.863 |
| 2.035752039526198 | 1.087 | 0.961 | 0.861 |
| 2.038893632179788 | 1.089 | 0.961 | 0.86 |
| 2.042035224833378 | 1.09 | 0.96 | 0.858 |
| 2.045176817486967 | 1.091 | 0.96 | 0.857 |
| 2.048318410140557 | 1.092 | 0.959 | 0.855 |
| 2.051460002794146 | 1.094 | 0.959 | 0.854 |
| 2.054601595447736 | 1.095 | 0.959 | 0.852 |
| 2.057743188101325 | 1.096 | 0.958 | 0.851 |
| 2.060884780754915 | 1.097 | 0.958 | 0.849 |
| 2.064026373408505 | 1.099 | 0.957 | 0.848 |
| 2.067167966062094 | 1.1 | 0.957 | 0.846 |
| 2.070309558715684 | 1.101 | 0.956 | 0.845 |
| 2.073451151369273 | 1.102 | 0.956 | 0.843 |
| 2.076592744022863 | 1.104 | 0.955 | 0.842 |
| 2.079734336676452 | 1.105 | 0.955 | 0.84 |
| 2.082875929330042 | 1.106 | 0.954 | 0.839 |
| 2.086017521983632 | 1.108 | 0.954 | 0.837 |
| 2.089159114637221 | 1.109 | 0.953 | 0.836 |
| 2.092300707290811 | 1.11 | 0.953 | 0.834 |
| 2.095442299944401 | 1.112 | 0.952 | 0.833 |
| 2.09858389259799 | 1.113 | 0.952 | 0.831 |
| 2.10172548525158 | 1.114 | 0.951 | 0.83 |
| 2.104867077905169 | 1.116 | 0.951 | 0.828 |
| 2.108008670558759 | 1.117 | 0.95 | 0.827 |
| 2.111150263212349 | 1.118 | 0.95 | 0.825 |
| 2.114291855865938 | 1.12 | 0.949 | 0.824 |
| 2.117433448519528 | 1.121 | 0.949 | 0.822 |
| 2.120575041173117 | 1.123 | 0.948 | 0.821 |
| 2.123716633826707 | 1.124 | 0.948 | 0.819 |
| 2.126858226480297 | 1.125 | 0.947 | 0.818 |
| 2.129999819133886 | 1.127 | 0.947 | 0.816 |
| 2.133141411787476 | 1.128 | 0.946 | 0.815 |
| 2.136283004441065 | 1.13 | 0.946 | 0.813 |
| 2.139424597094655 | 1.131 | 0.945 | 0.812 |
| 2.142566189748245 | 1.133 | 0.945 | 0.81 |
| 2.145707782401834 | 1.134 | 0.944 | 0.809 |
| 2.148849375055424 | 1.136 | 0.944 | 0.807 |
| 2.151990967709013 | 1.137 | 0.943 | 0.806 |
| 2.155132560362603 | 1.139 | 0.943 | 0.804 |
| 2.158274153016193 | 1.14 | 0.942 | 0.803 |
| 2.161415745669782 | 1.142 | 0.942 | 0.801 |
| 2.164557338323372 | 1.143 | 0.941 | 0.8 |
| 2.167698930976961 | 1.145 | 0.941 | 0.798 |
| 2.170840523630551 | 1.146 | 0.94 | 0.797 |
| 2.173982116284141 | 1.148 | 0.94 | 0.795 |
| 2.17712370893773 | 1.149 | 0.939 | 0.794 |
| 2.18026530159132 | 1.151 | 0.938 | 0.792 |
| 2.183406894244909 | 1.152 | 0.938 | 0.791 |
| 2.186548486898499 | 1.154 | 0.937 | 0.789 |
| 2.189690079552089 | 1.156 | 0.937 | 0.788 |
| 2.192831672205678 | 1.157 | 0.936 | 0.786 |
| 2.195973264859268 | 1.159 | 0.936 | 0.785 |
| 2.199114857512857 | 1.16 | 0.935 | 0.783 |
| 2.202256450166447 | 1.162 | 0.935 | 0.782 |
| 2.205398042820036 | 1.164 | 0.934 | 0.781 |
| 2.208539635473626 | 1.165 | 0.934 | 0.779 |
| 2.211681228127216 | 1.167 | 0.933 | 0.778 |
| 2.214822820780805 | 1.168 | 0.933 | 0.776 |
| 2.217964413434395 | 1.17 | 0.932 | 0.775 |
| 2.221106006087984 | 1.172 | 0.932 | 0.773 |
| 2.224247598741574 | 1.173 | 0.931 | 0.772 |
| 2.227389191395164 | 1.175 | 0.931 | 0.77 |
| 2.230530784048753 | 1.177 | 0.93 | 0.769 |
| 2.233672376702343 | 1.179 | 0.93 | 0.767 |
| 2.236813969355933 | 1.18 | 0.929 | 0.766 |
| 2.239955562009522 | 1.182 | 0.929 | 0.765 |
| 2.243097154663112 | 1.184 | 0.928 | 0.763 |
| 2.246238747316701 | 1.185 | 0.927 | 0.762 |
| 2.249380339970291 | 1.187 | 0.927 | 0.76 |
| 2.252521932623881 | 1.189 | 0.926 | 0.759 |
| 2.25566352527747 | 1.191 | 0.926 | 0.758 |
| 2.25880511793106 | 1.192 | 0.925 | 0.756 |
| 2.261946710584649 | 1.194 | 0.925 | 0.755 |
| 2.265088303238239 | 1.196 | 0.924 | 0.753 |
| 2.268229895891829 | 1.198 | 0.924 | 0.752 |
| 2.271371488545418 | 1.199 | 0.923 | 0.75 |
| 2.274513081199008 | 1.201 | 0.923 | 0.749 |
| 2.277654673852597 | 1.203 | 0.922 | 0.748 |
| 2.280796266506186 | 1.205 | 0.922 | 0.746 |
| 2.283937859159776 | 1.207 | 0.921 | 0.745 |
| 2.287079451813366 | 1.208 | 0.921 | 0.744 |
| 2.290221044466955 | 1.21 | 0.92 | 0.742 |
| 2.293362637120545 | 1.212 | 0.92 | 0.741 |
| 2.296504229774135 | 1.214 | 0.919 | 0.739 |
| 2.299645822427724 | 1.216 | 0.919 | 0.738 |
| 2.302787415081314 | 1.218 | 0.918 | 0.737 |
| 2.305929007734904 | 1.219 | 0.917 | 0.735 |
| 2.309070600388493 | 1.221 | 0.917 | 0.734 |
| 2.312212193042083 | 1.223 | 0.916 | 0.733 |
| 2.315353785695672 | 1.225 | 0.916 | 0.731 |
| 2.318495378349262 | 1.227 | 0.915 | 0.73 |
| 2.321636971002852 | 1.229 | 0.915 | 0.729 |
| 2.324778563656441 | 1.231 | 0.914 | 0.727 |
| 2.327920156310031 | 1.233 | 0.914 | 0.726 |
| 2.33106174896362 | 1.234 | 0.913 | 0.725 |
| 2.33420334161721 | 1.236 | 0.913 | 0.723 |
| 2.3373449342708 | 1.238 | 0.912 | 0.722 |
| 2.340486526924389 | 1.24 | 0.912 | 0.721 |
| 2.343628119577979 | 1.242 | 0.911 | 0.719 |
| 2.346769712231568 | 1.244 | 0.911 | 0.718 |
| 2.349911304885158 | 1.246 | 0.91 | 0.717 |
| 2.353052897538748 | 1.248 | 0.91 | 0.716 |
| 2.356194490192337 | 1.25 | 0.909 | 0.714 |
| 2.359336082845927 | 1.252 | 0.909 | 0.713 |
| 2.362477675499516 | 1.254 | 0.908 | 0.712 |
| 2.365619268153106 | 1.256 | 0.908 | 0.71 |
| 2.368760860806696 | 1.258 | 0.907 | 0.709 |
| 2.371902453460285 | 1.26 | 0.907 | 0.708 |
| 2.375044046113875 | 1.262 | 0.906 | 0.707 |
| 2.378185638767464 | 1.264 | 0.905 | 0.705 |
| 2.381327231421054 | 1.266 | 0.905 | 0.704 |
| 2.384468824074644 | 1.268 | 0.904 | 0.703 |
| 2.387610416728233 | 1.27 | 0.904 | 0.702 |
| 2.390752009381823 | 1.272 | 0.903 | 0.7 |
| 2.393893602035412 | 1.274 | 0.903 | 0.699 |
| 2.397035194689002 | 1.276 | 0.902 | 0.698 |
| 2.400176787342591 | 1.278 | 0.902 | 0.697 |
| 2.403318379996181 | 1.28 | 0.901 | 0.696 |
| 2.406459972649771 | 1.282 | 0.901 | 0.694 |
| 2.40960156530336 | 1.284 | 0.9 | 0.693 |
| 2.41274315795695 | 1.286 | 0.9 | 0.692 |
| 2.41588475061054 | 1.288 | 0.899 | 0.691 |
| 2.419026343264129 | 1.29 | 0.899 | 0.69 |
| 2.422167935917719 | 1.293 | 0.898 | 0.688 |
| 2.425309528571308 | 1.295 | 0.898 | 0.687 |
| 2.428451121224898 | 1.297 | 0.897 | 0.686 |
| 2.431592713878488 | 1.299 | 0.897 | 0.685 |
| 2.434734306532077 | 1.301 | 0.896 | 0.684 |
| 2.437875899185667 | 1.303 | 0.896 | 0.683 |
| 2.441017491839256 | 1.305 | 0.895 | 0.681 |
| 2.444159084492846 | 1.307 | 0.895 | 0.68 |
| 2.447300677146435 | 1.309 | 0.894 | 0.679 |
| 2.450442269800025 | 1.311 | 0.894 | 0.678 |
| 2.453583862453615 | 1.314 | 0.893 | 0.677 |
| 2.456725455107204 | 1.316 | 0.893 | 0.676 |
| 2.459867047760794 | 1.318 | 0.892 | 0.675 |
| 2.463008640414384 | 1.32 | 0.892 | 0.673 |
| 2.466150233067973 | 1.322 | 0.891 | 0.672 |
| 2.469291825721563 | 1.324 | 0.891 | 0.671 |
| 2.472433418375152 | 1.326 | 0.89 | 0.67 |
| 2.475575011028742 | 1.329 | 0.89 | 0.669 |
| 2.478716603682332 | 1.331 | 0.889 | 0.668 |
| 2.481858196335921 | 1.333 | 0.889 | 0.667 |
| 2.48499978898951 | 1.335 | 0.889 | 0.666 |
| 2.4881413816431 | 1.337 | 0.888 | 0.665 |
| 2.49128297429669 | 1.339 | 0.888 | 0.664 |
| 2.49442456695028 | 1.342 | 0.887 | 0.663 |
| 2.497566159603869 | 1.344 | 0.887 | 0.662 |
| 2.500707752257458 | 1.346 | 0.886 | 0.66 |
| 2.503849344911048 | 1.348 | 0.886 | 0.659 |
| 2.506990937564638 | 1.35 | 0.885 | 0.658 |
| 2.510132530218228 | 1.352 | 0.885 | 0.657 |
| 2.513274122871817 | 1.355 | 0.884 | 0.656 |
| 2.516415715525407 | 1.357 | 0.884 | 0.655 |
| 2.519557308178996 | 1.359 | 0.883 | 0.654 |
| 2.522698900832586 | 1.361 | 0.883 | 0.653 |
| 2.525840493486176 | 1.363 | 0.882 | 0.652 |
| 2.528982086139765 | 1.366 | 0.882 | 0.651 |
| 2.532123678793355 | 1.368 | 0.881 | 0.65 |
| 2.535265271446944 | 1.37 | 0.881 | 0.649 |
| 2.538406864100534 | 1.372 | 0.881 | 0.648 |
| 2.541548456754124 | 1.374 | 0.88 | 0.647 |
| 2.544690049407713 | 1.377 | 0.88 | 0.646 |
| 2.547831642061302 | 1.379 | 0.879 | 0.645 |
| 2.550973234714892 | 1.381 | 0.879 | 0.644 |
| 2.554114827368482 | 1.383 | 0.878 | 0.643 |
| 2.557256420022072 | 1.386 | 0.878 | 0.642 |
| 2.560398012675661 | 1.388 | 0.877 | 0.641 |
| 2.563539605329251 | 1.39 | 0.877 | 0.641 |
| 2.56668119798284 | 1.392 | 0.877 | 0.64 |
| 2.56982279063643 | 1.394 | 0.876 | 0.639 |
| 2.57296438329002 | 1.397 | 0.876 | 0.638 |
| 2.576105975943609 | 1.399 | 0.875 | 0.637 |
| 2.579247568597199 | 1.401 | 0.875 | 0.636 |
| 2.582389161250788 | 1.403 | 0.874 | 0.635 |
| 2.585530753904377 | 1.406 | 0.874 | 0.634 |
| 2.588672346557967 | 1.408 | 0.873 | 0.633 |
| 2.591813939211557 | 1.41 | 0.873 | 0.632 |
| 2.594955531865147 | 1.412 | 0.873 | 0.631 |
| 2.598097124518736 | 1.414 | 0.872 | 0.63 |
| 2.601238717172326 | 1.417 | 0.872 | 0.63 |
| 2.604380309825915 | 1.419 | 0.871 | 0.629 |
| 2.607521902479505 | 1.421 | 0.871 | 0.628 |
| 2.610663495133095 | 1.423 | 0.871 | 0.627 |
| 2.613805087786684 | 1.426 | 0.87 | 0.626 |
| 2.616946680440274 | 1.428 | 0.87 | 0.625 |
| 2.620088273093863 | 1.43 | 0.869 | 0.624 |
| 2.623229865747452 | 1.432 | 0.869 | 0.624 |
| 2.626371458401042 | 1.434 | 0.868 | 0.623 |
| 2.629513051054632 | 1.437 | 0.868 | 0.622 |
| 2.632654643708222 | 1.439 | 0.868 | 0.621 |
| 2.635796236361811 | 1.441 | 0.867 | 0.62 |
| 2.638937829015401 | 1.443 | 0.867 | 0.619 |
| 2.642079421668991 | 1.446 | 0.866 | 0.619 |
| 2.64522101432258 | 1.448 | 0.866 | 0.618 |
| 2.64836260697617 | 1.45 | 0.866 | 0.617 |
| 2.651504199629759 | 1.452 | 0.865 | 0.616 |
| 2.654645792283349 | 1.454 | 0.865 | 0.615 |
| 2.657787384936938 | 1.457 | 0.865 | 0.615 |
| 2.660928977590528 | 1.459 | 0.864 | 0.614 |
| 2.664070570244118 | 1.461 | 0.864 | 0.613 |
| 2.667212162897707 | 1.463 | 0.863 | 0.612 |
| 2.670353755551297 | 1.465 | 0.863 | 0.612 |
| 2.673495348204887 | 1.468 | 0.863 | 0.611 |
| 2.676636940858476 | 1.47 | 0.862 | 0.61 |
| 2.679778533512066 | 1.472 | 0.862 | 0.609 |
| 2.682920126165655 | 1.474 | 0.861 | 0.609 |
| 2.686061718819245 | 1.476 | 0.861 | 0.608 |
| 2.689203311472835 | 1.478 | 0.861 | 0.607 |
| 2.692344904126424 | 1.481 | 0.86 | 0.606 |
| 2.695486496780014 | 1.483 | 0.86 | 0.606 |
| 2.698628089433603 | 1.485 | 0.86 | 0.605 |
| 2.701769682087193 | 1.487 | 0.859 | 0.604 |
| 2.704911274740782 | 1.489 | 0.859 | 0.604 |
| 2.708052867394372 | 1.491 | 0.859 | 0.603 |
| 2.711194460047962 | 1.493 | 0.858 | 0.602 |
| 2.714336052701551 | 1.495 | 0.858 | 0.601 |
| 2.717477645355141 | 1.498 | 0.858 | 0.601 |
| 2.720619238008731 | 1.5 | 0.857 | 0.6 |
| 2.72376083066232 | 1.502 | 0.857 | 0.599 |
| 2.72690242331591 | 1.504 | 0.857 | 0.599 |
| 2.730044015969499 | 1.506 | 0.856 | 0.598 |
| 2.733185608623089 | 1.508 | 0.856 | 0.597 |
| 2.736327201276678 | 1.51 | 0.855 | 0.597 |
| 2.739468793930268 | 1.512 | 0.855 | 0.596 |
| 2.742610386583858 | 1.514 | 0.855 | 0.595 |
| 2.745751979237447 | 1.516 | 0.855 | 0.595 |
| 2.748893571891036 | 1.518 | 0.854 | 0.594 |
| 2.752035164544627 | 1.52 | 0.854 | 0.594 |
| 2.755176757198216 | 1.523 | 0.854 | 0.593 |
| 2.758318349851806 | 1.525 | 0.853 | 0.592 |
| 2.761459942505395 | 1.527 | 0.853 | 0.592 |
| 2.764601535158985 | 1.529 | 0.853 | 0.591 |
| 2.767743127812574 | 1.531 | 0.852 | 0.591 |
| 2.770884720466164 | 1.533 | 0.852 | 0.59 |
| 2.774026313119754 | 1.535 | 0.852 | 0.589 |
| 2.777167905773343 | 1.537 | 0.851 | 0.589 |
| 2.780309498426932 | 1.539 | 0.851 | 0.588 |
| 2.783451091080522 | 1.54 | 0.851 | 0.588 |
| 2.786592683734112 | 1.542 | 0.85 | 0.587 |
| 2.789734276387701 | 1.544 | 0.85 | 0.587 |
| 2.792875869041291 | 1.546 | 0.85 | 0.586 |
| 2.796017461694881 | 1.548 | 0.85 | 0.585 |
| 2.79915905434847 | 1.55 | 0.849 | 0.585 |
| 2.80230064700206 | 1.552 | 0.849 | 0.584 |
| 2.80544223965565 | 1.554 | 0.849 | 0.584 |
| 2.808583832309239 | 1.556 | 0.848 | 0.583 |
| 2.811725424962829 | 1.558 | 0.848 | 0.583 |
| 2.814867017616419 | 1.56 | 0.848 | 0.582 |
| 2.818008610270008 | 1.561 | 0.848 | 0.582 |
| 2.821150202923598 | 1.563 | 0.847 | 0.581 |
| 2.824291795577187 | 1.565 | 0.847 | 0.581 |
| 2.827433388230777 | 1.567 | 0.847 | 0.58 |
| 2.830574980884366 | 1.569 | 0.847 | 0.58 |
| 2.833716573537956 | 1.571 | 0.846 | 0.579 |
| 2.836858166191546 | 1.572 | 0.846 | 0.579 |
| 2.839999758845135 | 1.574 | 0.846 | 0.578 |
| 2.843141351498725 | 1.576 | 0.846 | 0.578 |
| 2.846282944152314 | 1.578 | 0.845 | 0.577 |
| 2.849424536805904 | 1.579 | 0.845 | 0.577 |
| 2.852566129459494 | 1.581 | 0.845 | 0.576 |
| 2.855707722113083 | 1.583 | 0.845 | 0.576 |
| 2.858849314766673 | 1.584 | 0.844 | 0.575 |
| 2.861990907420262 | 1.586 | 0.844 | 0.575 |
| 2.865132500073852 | 1.588 | 0.844 | 0.575 |
| 2.868274092727442 | 1.589 | 0.844 | 0.574 |
| 2.871415685381031 | 1.591 | 0.843 | 0.574 |
| 2.874557278034621 | 1.593 | 0.843 | 0.573 |
| 2.87769887068821 | 1.594 | 0.843 | 0.573 |
| 2.8808404633418 | 1.596 | 0.843 | 0.572 |
| 2.88398205599539 | 1.598 | 0.842 | 0.572 |
| 2.88712364864898 | 1.599 | 0.842 | 0.572 |
| 2.890265241302569 | 1.601 | 0.842 | 0.571 |
| 2.893406833956158 | 1.602 | 0.842 | 0.571 |
| 2.896548426609748 | 1.604 | 0.842 | 0.57 |
| 2.899690019263338 | 1.605 | 0.841 | 0.57 |
| 2.902831611916927 | 1.607 | 0.841 | 0.57 |
| 2.905973204570517 | 1.608 | 0.841 | 0.569 |
| 2.909114797224106 | 1.61 | 0.841 | 0.569 |
| 2.912256389877696 | 1.611 | 0.841 | 0.569 |
| 2.915397982531286 | 1.613 | 0.84 | 0.568 |
| 2.918539575184875 | 1.614 | 0.84 | 0.568 |
| 2.921681167838465 | 1.615 | 0.84 | 0.568 |
| 2.924822760492054 | 1.617 | 0.84 | 0.567 |
| 2.927964353145644 | 1.618 | 0.84 | 0.567 |
| 2.931105945799234 | 1.62 | 0.839 | 0.567 |
| 2.934247538452823 | 1.621 | 0.839 | 0.566 |
| 2.937389131106413 | 1.622 | 0.839 | 0.566 |
| 2.940530723760002 | 1.623 | 0.839 | 0.566 |
| 2.943672316413592 | 1.625 | 0.839 | 0.565 |
| 2.946813909067182 | 1.626 | 0.839 | 0.565 |
| 2.949955501720771 | 1.627 | 0.838 | 0.565 |
| 2.953097094374361 | 1.629 | 0.838 | 0.564 |
| 2.95623868702795 | 1.63 | 0.838 | 0.564 |
| 2.95938027968154 | 1.631 | 0.838 | 0.564 |
| 2.96252187233513 | 1.632 | 0.838 | 0.564 |
| 2.965663464988719 | 1.633 | 0.838 | 0.563 |
| 2.968805057642309 | 1.634 | 0.837 | 0.563 |
| 2.971946650295898 | 1.636 | 0.837 | 0.563 |
| 2.975088242949488 | 1.637 | 0.837 | 0.562 |
| 2.978229835603078 | 1.638 | 0.837 | 0.562 |
| 2.981371428256667 | 1.639 | 0.837 | 0.562 |
| 2.984513020910257 | 1.64 | 0.837 | 0.562 |
| 2.987654613563846 | 1.641 | 0.837 | 0.561 |
| 2.990796206217436 | 1.642 | 0.836 | 0.561 |
| 2.993937798871025 | 1.643 | 0.836 | 0.561 |
| 2.997079391524615 | 1.644 | 0.836 | 0.561 |
| 3.000220984178205 | 1.645 | 0.836 | 0.561 |
| 3.003362576831794 | 1.646 | 0.836 | 0.56 |
| 3.006504169485384 | 1.647 | 0.836 | 0.56 |
| 3.009645762138974 | 1.648 | 0.836 | 0.56 |
| 3.012787354792563 | 1.649 | 0.836 | 0.56 |
| 3.015928947446153 | 1.649 | 0.836 | 0.559 |
| 3.019070540099742 | 1.65 | 0.835 | 0.559 |
| 3.022212132753332 | 1.651 | 0.835 | 0.559 |
| 3.025353725406922 | 1.652 | 0.835 | 0.559 |
| 3.028495318060511 | 1.653 | 0.835 | 0.559 |
| 3.031636910714101 | 1.653 | 0.835 | 0.559 |
| 3.03477850336769 | 1.654 | 0.835 | 0.558 |
| 3.03792009602128 | 1.655 | 0.835 | 0.558 |
| 3.04106168867487 | 1.656 | 0.835 | 0.558 |
| 3.04420328132846 | 1.656 | 0.835 | 0.558 |
| 3.047344873982049 | 1.657 | 0.835 | 0.558 |
| 3.050486466635638 | 1.658 | 0.834 | 0.558 |
| 3.053628059289228 | 1.658 | 0.834 | 0.557 |
| 3.056769651942818 | 1.659 | 0.834 | 0.557 |
| 3.059911244596407 | 1.659 | 0.834 | 0.557 |
| 3.063052837249997 | 1.66 | 0.834 | 0.557 |
| 3.066194429903586 | 1.66 | 0.834 | 0.557 |
| 3.069336022557176 | 1.661 | 0.834 | 0.557 |
| 3.072477615210766 | 1.661 | 0.834 | 0.557 |
| 3.075619207864355 | 1.662 | 0.834 | 0.557 |
| 3.078760800517945 | 1.662 | 0.834 | 0.557 |
| 3.081902393171534 | 1.663 | 0.834 | 0.556 |
| 3.085043985825124 | 1.663 | 0.834 | 0.556 |
| 3.088185578478713 | 1.664 | 0.834 | 0.556 |
| 3.091327171132303 | 1.664 | 0.834 | 0.556 |
| 3.094468763785893 | 1.664 | 0.834 | 0.556 |
| 3.097610356439482 | 1.665 | 0.834 | 0.556 |
| 3.100751949093072 | 1.665 | 0.834 | 0.556 |
| 3.103893541746661 | 1.665 | 0.834 | 0.556 |
| 3.107035134400251 | 1.665 | 0.833 | 0.556 |
| 3.110176727053841 | 1.666 | 0.833 | 0.556 |
| 3.11331831970743 | 1.666 | 0.833 | 0.556 |
| 3.11645991236102 | 1.666 | 0.833 | 0.556 |
| 3.11960150501461 | 1.666 | 0.833 | 0.556 |
| 3.122743097668199 | 1.666 | 0.833 | 0.556 |
| 3.125884690321789 | 1.666 | 0.833 | 0.556 |
| 3.129026282975378 | 1.666 | 0.833 | 0.556 |
| 3.132167875628968 | 1.667 | 0.833 | 0.556 |
| 3.135309468282557 | 1.667 | 0.833 | 0.556 |
| 3.138451060936147 | 1.667 | 0.833 | 0.556 |
| 3.141592653589737 | 1.667 | 0.833 | 0.556 |
| 3.144734246243326 | 1.667 | 0.833 | 0.556 |
| 3.147875838896916 | 1.667 | 0.833 | 0.556 |
| 3.151017431550505 | 1.667 | 0.833 | 0.556 |
| 3.154159024204095 | 1.666 | 0.833 | 0.556 |
| 3.157300616857685 | 1.666 | 0.833 | 0.556 |
| 3.160442209511274 | 1.666 | 0.833 | 0.556 |
| 3.163583802164864 | 1.666 | 0.833 | 0.556 |
| 3.166725394818453 | 1.666 | 0.833 | 0.556 |
| 3.169866987472043 | 1.666 | 0.833 | 0.556 |
| 3.173008580125633 | 1.666 | 0.833 | 0.556 |
| 3.176150172779222 | 1.665 | 0.833 | 0.556 |
| 3.179291765432812 | 1.665 | 0.834 | 0.556 |
| 3.182433358086401 | 1.665 | 0.834 | 0.556 |
| 3.185574950739991 | 1.665 | 0.834 | 0.556 |
| 3.188716543393581 | 1.664 | 0.834 | 0.556 |
| 3.19185813604717 | 1.664 | 0.834 | 0.556 |
| 3.19499972870076 | 1.664 | 0.834 | 0.556 |
| 3.198141321354349 | 1.663 | 0.834 | 0.556 |
| 3.20128291400794 | 1.663 | 0.834 | 0.556 |
| 3.204424506661528 | 1.662 | 0.834 | 0.557 |
| 3.207566099315118 | 1.662 | 0.834 | 0.557 |
| 3.210707691968708 | 1.661 | 0.834 | 0.557 |
| 3.213849284622297 | 1.661 | 0.834 | 0.557 |
| 3.216990877275887 | 1.66 | 0.834 | 0.557 |
| 3.220132469929476 | 1.66 | 0.834 | 0.557 |
| 3.223274062583066 | 1.659 | 0.834 | 0.557 |
| 3.226415655236656 | 1.659 | 0.834 | 0.557 |
| 3.229557247890245 | 1.658 | 0.834 | 0.557 |
| 3.232698840543835 | 1.658 | 0.834 | 0.558 |
| 3.235840433197425 | 1.657 | 0.835 | 0.558 |
| 3.238982025851014 | 1.656 | 0.835 | 0.558 |
| 3.242123618504604 | 1.656 | 0.835 | 0.558 |
| 3.245265211158193 | 1.655 | 0.835 | 0.558 |
| 3.248406803811783 | 1.654 | 0.835 | 0.558 |
| 3.251548396465373 | 1.653 | 0.835 | 0.559 |
| 3.254689989118962 | 1.653 | 0.835 | 0.559 |
| 3.257831581772551 | 1.652 | 0.835 | 0.559 |
| 3.260973174426141 | 1.651 | 0.835 | 0.559 |
| 3.26411476707973 | 1.65 | 0.835 | 0.559 |
| 3.267256359733321 | 1.649 | 0.836 | 0.559 |
| 3.27039795238691 | 1.649 | 0.836 | 0.56 |
| 3.2735395450405 | 1.648 | 0.836 | 0.56 |
| 3.276681137694089 | 1.647 | 0.836 | 0.56 |
| 3.279822730347679 | 1.646 | 0.836 | 0.56 |
| 3.282964323001269 | 1.645 | 0.836 | 0.561 |
| 3.286105915654858 | 1.644 | 0.836 | 0.561 |
| 3.289247508308448 | 1.643 | 0.836 | 0.561 |
| 3.292389100962037 | 1.642 | 0.836 | 0.561 |
| 3.295530693615627 | 1.641 | 0.837 | 0.561 |
| 3.298672286269217 | 1.64 | 0.837 | 0.562 |
| 3.301813878922806 | 1.639 | 0.837 | 0.562 |
| 3.304955471576396 | 1.638 | 0.837 | 0.562 |
| 3.308097064229985 | 1.637 | 0.837 | 0.562 |
| 3.311238656883575 | 1.636 | 0.837 | 0.563 |
| 3.314380249537165 | 1.634 | 0.837 | 0.563 |
| 3.317521842190754 | 1.633 | 0.838 | 0.563 |
| 3.320663434844344 | 1.632 | 0.838 | 0.564 |
| 3.323805027497933 | 1.631 | 0.838 | 0.564 |
| 3.326946620151523 | 1.63 | 0.838 | 0.564 |
| 3.330088212805113 | 1.629 | 0.838 | 0.564 |
| 3.333229805458702 | 1.627 | 0.838 | 0.565 |
| 3.336371398112292 | 1.626 | 0.839 | 0.565 |
| 3.339512990765881 | 1.625 | 0.839 | 0.565 |
| 3.342654583419471 | 1.623 | 0.839 | 0.566 |
| 3.345796176073061 | 1.622 | 0.839 | 0.566 |
| 3.34893776872665 | 1.621 | 0.839 | 0.566 |
| 3.35207936138024 | 1.62 | 0.839 | 0.567 |
| 3.355220954033829 | 1.618 | 0.84 | 0.567 |
| 3.358362546687419 | 1.617 | 0.84 | 0.567 |
| 3.361504139341009 | 1.615 | 0.84 | 0.568 |
| 3.364645731994598 | 1.614 | 0.84 | 0.568 |
| 3.367787324648188 | 1.613 | 0.84 | 0.568 |
| 3.370928917301777 | 1.611 | 0.841 | 0.569 |
| 3.374070509955367 | 1.61 | 0.841 | 0.569 |
| 3.377212102608956 | 1.608 | 0.841 | 0.569 |
| 3.380353695262546 | 1.607 | 0.841 | 0.57 |
| 3.383495287916136 | 1.605 | 0.841 | 0.57 |
| 3.386636880569725 | 1.604 | 0.842 | 0.57 |
| 3.389778473223315 | 1.602 | 0.842 | 0.571 |
| 3.392920065876904 | 1.601 | 0.842 | 0.571 |
| 3.396061658530494 | 1.599 | 0.842 | 0.572 |
| 3.399203251184084 | 1.598 | 0.842 | 0.572 |
| 3.402344843837673 | 1.596 | 0.843 | 0.572 |
| 3.405486436491263 | 1.594 | 0.843 | 0.573 |
| 3.408628029144852 | 1.593 | 0.843 | 0.573 |
| 3.411769621798442 | 1.591 | 0.843 | 0.574 |
| 3.414911214452032 | 1.589 | 0.844 | 0.574 |
| 3.418052807105621 | 1.588 | 0.844 | 0.575 |
| 3.421194399759211 | 1.586 | 0.844 | 0.575 |
| 3.4243359924128 | 1.584 | 0.844 | 0.575 |
| 3.42747758506639 | 1.583 | 0.845 | 0.576 |
| 3.43061917771998 | 1.581 | 0.845 | 0.576 |
| 3.433760770373569 | 1.579 | 0.845 | 0.577 |
| 3.436902363027159 | 1.578 | 0.845 | 0.577 |
| 3.440043955680748 | 1.576 | 0.846 | 0.578 |
| 3.443185548334338 | 1.574 | 0.846 | 0.578 |
| 3.446327140987927 | 1.572 | 0.846 | 0.579 |
| 3.449468733641517 | 1.571 | 0.846 | 0.579 |
| 3.452610326295107 | 1.569 | 0.847 | 0.58 |
| 3.455751918948696 | 1.567 | 0.847 | 0.58 |
| 3.458893511602286 | 1.565 | 0.847 | 0.581 |
| 3.462035104255876 | 1.563 | 0.847 | 0.581 |
| 3.465176696909465 | 1.561 | 0.848 | 0.582 |
| 3.468318289563055 | 1.56 | 0.848 | 0.582 |
| 3.471459882216644 | 1.558 | 0.848 | 0.583 |
| 3.474601474870234 | 1.556 | 0.848 | 0.583 |
| 3.477743067523824 | 1.554 | 0.849 | 0.584 |
| 3.480884660177413 | 1.552 | 0.849 | 0.584 |
| 3.484026252831002 | 1.55 | 0.849 | 0.585 |
| 3.487167845484592 | 1.548 | 0.85 | 0.585 |
| 3.490309438138182 | 1.546 | 0.85 | 0.586 |
| 3.493451030791772 | 1.544 | 0.85 | 0.587 |
| 3.496592623445361 | 1.542 | 0.85 | 0.587 |
| 3.499734216098951 | 1.54 | 0.851 | 0.588 |
| 3.50287580875254 | 1.539 | 0.851 | 0.588 |
| 3.50601740140613 | 1.537 | 0.851 | 0.589 |
| 3.50915899405972 | 1.535 | 0.852 | 0.589 |
| 3.512300586713309 | 1.533 | 0.852 | 0.59 |
| 3.515442179366899 | 1.531 | 0.852 | 0.591 |
| 3.518583772020488 | 1.529 | 0.853 | 0.591 |
| 3.521725364674078 | 1.527 | 0.853 | 0.592 |
| 3.524866957327668 | 1.525 | 0.853 | 0.592 |
| 3.528008549981257 | 1.523 | 0.854 | 0.593 |
| 3.531150142634847 | 1.52 | 0.854 | 0.594 |
| 3.534291735288436 | 1.518 | 0.854 | 0.594 |
| 3.537433327942026 | 1.516 | 0.855 | 0.595 |
| 3.540574920595616 | 1.514 | 0.855 | 0.595 |
| 3.543716513249205 | 1.512 | 0.855 | 0.596 |
| 3.546858105902795 | 1.51 | 0.855 | 0.597 |
| 3.549999698556384 | 1.508 | 0.856 | 0.597 |
| 3.553141291209974 | 1.506 | 0.856 | 0.598 |
| 3.556282883863564 | 1.504 | 0.857 | 0.599 |
| 3.559424476517153 | 1.502 | 0.857 | 0.599 |
| 3.562566069170743 | 1.5 | 0.857 | 0.6 |
| 3.565707661824332 | 1.498 | 0.858 | 0.601 |
| 3.568849254477922 | 1.495 | 0.858 | 0.601 |
| 3.571990847131511 | 1.493 | 0.858 | 0.602 |
| 3.575132439785101 | 1.491 | 0.859 | 0.603 |
| 3.578274032438691 | 1.489 | 0.859 | 0.604 |
| 3.58141562509228 | 1.487 | 0.859 | 0.604 |
| 3.58455721774587 | 1.485 | 0.86 | 0.605 |
| 3.58769881039946 | 1.483 | 0.86 | 0.606 |
| 3.590840403053049 | 1.481 | 0.86 | 0.606 |
| 3.593981995706639 | 1.478 | 0.861 | 0.607 |
| 3.597123588360228 | 1.476 | 0.861 | 0.608 |
| 3.600265181013818 | 1.474 | 0.861 | 0.609 |
| 3.603406773667407 | 1.472 | 0.862 | 0.609 |
| 3.606548366320997 | 1.47 | 0.862 | 0.61 |
| 3.609689958974587 | 1.468 | 0.863 | 0.611 |
| 3.612831551628176 | 1.465 | 0.863 | 0.612 |
| 3.615973144281766 | 1.463 | 0.863 | 0.612 |
| 3.619114736935355 | 1.461 | 0.864 | 0.613 |
| 3.622256329588945 | 1.459 | 0.864 | 0.614 |
| 3.625397922242534 | 1.457 | 0.865 | 0.615 |
| 3.628539514896124 | 1.454 | 0.865 | 0.615 |
| 3.631681107549714 | 1.452 | 0.865 | 0.616 |
| 3.634822700203303 | 1.45 | 0.866 | 0.617 |
| 3.637964292856893 | 1.448 | 0.866 | 0.618 |
| 3.641105885510483 | 1.446 | 0.866 | 0.619 |
| 3.644247478164072 | 1.443 | 0.867 | 0.619 |
| 3.647389070817662 | 1.441 | 0.867 | 0.62 |
| 3.650530663471251 | 1.439 | 0.868 | 0.621 |
| 3.653672256124841 | 1.437 | 0.868 | 0.622 |
| 3.656813848778431 | 1.434 | 0.868 | 0.623 |
| 3.65995544143202 | 1.432 | 0.869 | 0.624 |
| 3.66309703408561 | 1.43 | 0.869 | 0.624 |
| 3.666238626739199 | 1.428 | 0.87 | 0.625 |
| 3.66938021939279 | 1.426 | 0.87 | 0.626 |
| 3.672521812046378 | 1.423 | 0.871 | 0.627 |
| 3.675663404699968 | 1.421 | 0.871 | 0.628 |
| 3.678804997353558 | 1.419 | 0.871 | 0.629 |
| 3.681946590007147 | 1.417 | 0.872 | 0.63 |
| 3.685088182660737 | 1.414 | 0.872 | 0.63 |
| 3.688229775314326 | 1.412 | 0.873 | 0.631 |
| 3.691371367967916 | 1.41 | 0.873 | 0.632 |
| 3.694512960621506 | 1.408 | 0.873 | 0.633 |
| 3.697654553275095 | 1.406 | 0.874 | 0.634 |
| 3.700796145928685 | 1.403 | 0.874 | 0.635 |
| 3.703937738582274 | 1.401 | 0.875 | 0.636 |
| 3.707079331235864 | 1.399 | 0.875 | 0.637 |
| 3.710220923889454 | 1.397 | 0.876 | 0.638 |
| 3.713362516543043 | 1.394 | 0.876 | 0.639 |
| 3.716504109196633 | 1.392 | 0.877 | 0.64 |
| 3.719645701850223 | 1.39 | 0.877 | 0.641 |
| 3.722787294503812 | 1.388 | 0.877 | 0.641 |
| 3.725928887157402 | 1.386 | 0.878 | 0.642 |
| 3.729070479810991 | 1.383 | 0.878 | 0.643 |
| 3.732212072464581 | 1.381 | 0.879 | 0.644 |
| 3.735353665118171 | 1.379 | 0.879 | 0.645 |
| 3.73849525777176 | 1.377 | 0.88 | 0.646 |
| 3.74163685042535 | 1.374 | 0.88 | 0.647 |
| 3.744778443078939 | 1.372 | 0.881 | 0.648 |
| 3.747920035732529 | 1.37 | 0.881 | 0.649 |
| 3.751061628386119 | 1.368 | 0.881 | 0.65 |
| 3.754203221039708 | 1.366 | 0.882 | 0.651 |
| 3.757344813693298 | 1.363 | 0.882 | 0.652 |
| 3.760486406346887 | 1.361 | 0.883 | 0.653 |
| 3.763627999000477 | 1.359 | 0.883 | 0.654 |
| 3.766769591654067 | 1.357 | 0.884 | 0.655 |
| 3.769911184307656 | 1.355 | 0.884 | 0.656 |
| 3.773052776961246 | 1.352 | 0.885 | 0.657 |
| 3.776194369614835 | 1.35 | 0.885 | 0.658 |
| 3.779335962268425 | 1.348 | 0.886 | 0.659 |
| 3.782477554922014 | 1.346 | 0.886 | 0.66 |
| 3.785619147575604 | 1.344 | 0.887 | 0.662 |
| 3.788760740229193 | 1.342 | 0.887 | 0.663 |
| 3.791902332882783 | 1.339 | 0.888 | 0.664 |
| 3.795043925536373 | 1.337 | 0.888 | 0.665 |
| 3.798185518189962 | 1.335 | 0.889 | 0.666 |
| 3.801327110843552 | 1.333 | 0.889 | 0.667 |
| 3.804468703497142 | 1.331 | 0.889 | 0.668 |
| 3.807610296150731 | 1.329 | 0.89 | 0.669 |
| 3.810751888804321 | 1.326 | 0.89 | 0.67 |
| 3.813893481457911 | 1.324 | 0.891 | 0.671 |
| 3.8170350741115 | 1.322 | 0.891 | 0.672 |
| 3.82017666676509 | 1.32 | 0.892 | 0.673 |
| 3.823318259418679 | 1.318 | 0.892 | 0.675 |
| 3.826459852072269 | 1.316 | 0.893 | 0.676 |
| 3.829601444725859 | 1.314 | 0.893 | 0.677 |
| 3.832743037379448 | 1.311 | 0.894 | 0.678 |
| 3.835884630033038 | 1.309 | 0.894 | 0.679 |
| 3.839026222686627 | 1.307 | 0.895 | 0.68 |
| 3.842167815340217 | 1.305 | 0.895 | 0.681 |
| 3.845309407993807 | 1.303 | 0.896 | 0.683 |
| 3.848451000647396 | 1.301 | 0.896 | 0.684 |
| 3.851592593300986 | 1.299 | 0.897 | 0.685 |
| 3.854734185954575 | 1.297 | 0.897 | 0.686 |
| 3.857875778608165 | 1.295 | 0.898 | 0.687 |
| 3.861017371261755 | 1.293 | 0.898 | 0.688 |
| 3.864158963915344 | 1.29 | 0.899 | 0.69 |
| 3.867300556568933 | 1.288 | 0.899 | 0.691 |
| 3.870442149222523 | 1.286 | 0.9 | 0.692 |
| 3.873583741876112 | 1.284 | 0.9 | 0.693 |
| 3.876725334529703 | 1.282 | 0.901 | 0.694 |
| 3.879866927183292 | 1.28 | 0.901 | 0.696 |
| 3.883008519836882 | 1.278 | 0.902 | 0.697 |
| 3.886150112490471 | 1.276 | 0.902 | 0.698 |
| 3.889291705144061 | 1.274 | 0.903 | 0.699 |
| 3.892433297797651 | 1.272 | 0.903 | 0.7 |
| 3.89557489045124 | 1.27 | 0.904 | 0.702 |
| 3.89871648310483 | 1.268 | 0.904 | 0.703 |
| 3.901858075758419 | 1.266 | 0.905 | 0.704 |
| 3.904999668412009 | 1.264 | 0.905 | 0.705 |
| 3.908141261065598 | 1.262 | 0.906 | 0.707 |
| 3.911282853719188 | 1.26 | 0.907 | 0.708 |
| 3.914424446372778 | 1.258 | 0.907 | 0.709 |
| 3.917566039026367 | 1.256 | 0.908 | 0.71 |
| 3.920707631679957 | 1.254 | 0.908 | 0.712 |
| 3.923849224333547 | 1.252 | 0.909 | 0.713 |
| 3.926990816987136 | 1.25 | 0.909 | 0.714 |
| 3.930132409640726 | 1.248 | 0.91 | 0.716 |
| 3.933274002294315 | 1.246 | 0.91 | 0.717 |
| 3.936415594947905 | 1.244 | 0.911 | 0.718 |
| 3.939557187601495 | 1.242 | 0.911 | 0.719 |
| 3.942698780255084 | 1.24 | 0.912 | 0.721 |
| 3.945840372908674 | 1.238 | 0.912 | 0.722 |
| 3.948981965562263 | 1.236 | 0.913 | 0.723 |
| 3.952123558215853 | 1.234 | 0.913 | 0.725 |
| 3.955265150869442 | 1.233 | 0.914 | 0.726 |
| 3.958406743523032 | 1.231 | 0.914 | 0.727 |
| 3.961548336176622 | 1.229 | 0.915 | 0.729 |
| 3.964689928830211 | 1.227 | 0.915 | 0.73 |
| 3.967831521483801 | 1.225 | 0.916 | 0.731 |
| 3.97097311413739 | 1.223 | 0.916 | 0.733 |
| 3.97411470679098 | 1.221 | 0.917 | 0.734 |
| 3.97725629944457 | 1.219 | 0.917 | 0.735 |
| 3.98039789209816 | 1.218 | 0.918 | 0.737 |
| 3.983539484751749 | 1.216 | 0.919 | 0.738 |
| 3.986681077405338 | 1.214 | 0.919 | 0.739 |
| 3.989822670058928 | 1.212 | 0.92 | 0.741 |
| 3.992964262712517 | 1.21 | 0.92 | 0.742 |
| 3.996105855366107 | 1.208 | 0.921 | 0.744 |
| 3.999247448019697 | 1.207 | 0.921 | 0.745 |
| 4.002389040673287 | 1.205 | 0.922 | 0.746 |
| 4.005530633326877 | 1.203 | 0.922 | 0.748 |
| 4.008672225980466 | 1.201 | 0.923 | 0.749 |
| 4.011813818634056 | 1.199 | 0.923 | 0.75 |
| 4.014955411287645 | 1.198 | 0.924 | 0.752 |
| 4.018097003941234 | 1.196 | 0.924 | 0.753 |
| 4.021238596594824 | 1.194 | 0.925 | 0.755 |
| 4.024380189248414 | 1.192 | 0.925 | 0.756 |
| 4.027521781902004 | 1.191 | 0.926 | 0.758 |
| 4.030663374555593 | 1.189 | 0.926 | 0.759 |
| 4.033804967209183 | 1.187 | 0.927 | 0.76 |
| 4.036946559862773 | 1.185 | 0.927 | 0.762 |
| 4.040088152516362 | 1.184 | 0.928 | 0.763 |
| 4.043229745169951 | 1.182 | 0.929 | 0.765 |
| 4.046371337823541 | 1.18 | 0.929 | 0.766 |
| 4.049512930477131 | 1.179 | 0.93 | 0.767 |
| 4.05265452313072 | 1.177 | 0.93 | 0.769 |
| 4.05579611578431 | 1.175 | 0.931 | 0.77 |
| 4.0589377084379 | 1.173 | 0.931 | 0.772 |
| 4.062079301091489 | 1.172 | 0.932 | 0.773 |
| 4.065220893745079 | 1.17 | 0.932 | 0.775 |
| 4.068362486398668 | 1.168 | 0.933 | 0.776 |
| 4.071504079052258 | 1.167 | 0.933 | 0.778 |
| 4.074645671705848 | 1.165 | 0.934 | 0.779 |
| 4.077787264359437 | 1.164 | 0.934 | 0.781 |
| 4.080928857013027 | 1.162 | 0.935 | 0.782 |
| 4.084070449666616 | 1.16 | 0.935 | 0.783 |
| 4.087212042320206 | 1.159 | 0.936 | 0.785 |
| 4.090353634973795 | 1.157 | 0.936 | 0.786 |
| 4.093495227627385 | 1.156 | 0.937 | 0.788 |
| 4.096636820280975 | 1.154 | 0.937 | 0.789 |
| 4.099778412934564 | 1.152 | 0.938 | 0.791 |
| 4.102920005588154 | 1.151 | 0.938 | 0.792 |
| 4.106061598241744 | 1.149 | 0.939 | 0.794 |
| 4.109203190895333 | 1.148 | 0.94 | 0.795 |
| 4.112344783548923 | 1.146 | 0.94 | 0.797 |
| 4.115486376202512 | 1.145 | 0.941 | 0.798 |
| 4.118627968856102 | 1.143 | 0.941 | 0.8 |
| 4.121769561509692 | 1.142 | 0.942 | 0.801 |
| 4.124911154163281 | 1.14 | 0.942 | 0.803 |
| 4.128052746816871 | 1.139 | 0.943 | 0.804 |
| 4.13119433947046 | 1.137 | 0.943 | 0.806 |
| 4.13433593212405 | 1.136 | 0.944 | 0.807 |
| 4.13747752477764 | 1.134 | 0.944 | 0.809 |
| 4.14061911743123 | 1.133 | 0.945 | 0.81 |
| 4.143760710084818 | 1.131 | 0.945 | 0.812 |
| 4.146902302738408 | 1.13 | 0.946 | 0.813 |
| 4.150043895391998 | 1.128 | 0.946 | 0.815 |
| 4.153185488045588 | 1.127 | 0.947 | 0.816 |
| 4.156327080699177 | 1.125 | 0.947 | 0.818 |
| 4.159468673352766 | 1.124 | 0.948 | 0.819 |
| 4.162610266006356 | 1.123 | 0.948 | 0.821 |
| 4.165751858659946 | 1.121 | 0.949 | 0.822 |
| 4.168893451313535 | 1.12 | 0.949 | 0.824 |
| 4.172035043967125 | 1.118 | 0.95 | 0.825 |
| 4.175176636620715 | 1.117 | 0.95 | 0.827 |
| 4.178318229274304 | 1.116 | 0.951 | 0.828 |
| 4.181459821927894 | 1.114 | 0.951 | 0.83 |
| 4.184601414581484 | 1.113 | 0.952 | 0.831 |
| 4.187743007235073 | 1.112 | 0.952 | 0.833 |
| 4.190884599888663 | 1.11 | 0.953 | 0.834 |
| 4.194026192542252 | 1.109 | 0.953 | 0.836 |
| 4.197167785195842 | 1.108 | 0.954 | 0.837 |
| 4.200309377849432 | 1.106 | 0.954 | 0.839 |
| 4.203450970503021 | 1.105 | 0.955 | 0.84 |
| 4.206592563156611 | 1.104 | 0.955 | 0.842 |
| 4.2097341558102 | 1.102 | 0.956 | 0.843 |
| 4.21287574846379 | 1.101 | 0.956 | 0.845 |
| 4.21601734111738 | 1.1 | 0.957 | 0.846 |
| 4.21915893377097 | 1.099 | 0.957 | 0.848 |
| 4.222300526424559 | 1.097 | 0.958 | 0.849 |
| 4.225442119078148 | 1.096 | 0.958 | 0.851 |
| 4.228583711731738 | 1.095 | 0.959 | 0.852 |
| 4.231725304385327 | 1.094 | 0.959 | 0.854 |
| 4.234866897038917 | 1.092 | 0.959 | 0.855 |
| 4.238008489692506 | 1.091 | 0.96 | 0.857 |
| 4.241150082346096 | 1.09 | 0.96 | 0.858 |
| 4.244291674999685 | 1.089 | 0.961 | 0.86 |
| 4.247433267653276 | 1.087 | 0.961 | 0.861 |
| 4.250574860306865 | 1.086 | 0.962 | 0.863 |
| 4.253716452960455 | 1.085 | 0.962 | 0.864 |
| 4.256858045614044 | 1.084 | 0.963 | 0.866 |
| 4.259999638267634 | 1.083 | 0.963 | 0.867 |
| 4.263141230921224 | 1.082 | 0.964 | 0.869 |
| 4.266282823574813 | 1.08 | 0.964 | 0.87 |
| 4.269424416228403 | 1.079 | 0.965 | 0.872 |
| 4.272566008881992 | 1.078 | 0.965 | 0.873 |
| 4.275707601535582 | 1.077 | 0.965 | 0.875 |
| 4.27884919418917 | 1.076 | 0.966 | 0.876 |
| 4.28199078684276 | 1.075 | 0.966 | 0.878 |
| 4.285132379496351 | 1.074 | 0.967 | 0.879 |
| 4.28827397214994 | 1.073 | 0.967 | 0.881 |
| 4.29141556480353 | 1.072 | 0.968 | 0.882 |
| 4.294557157457119 | 1.071 | 0.968 | 0.884 |
| 4.29769875011071 | 1.069 | 0.969 | 0.885 |
| 4.300840342764299 | 1.068 | 0.969 | 0.887 |
| 4.303981935417888 | 1.067 | 0.969 | 0.888 |
| 4.307123528071478 | 1.066 | 0.97 | 0.889 |
| 4.310265120725067 | 1.065 | 0.97 | 0.891 |
| 4.313406713378657 | 1.064 | 0.971 | 0.892 |
| 4.316548306032247 | 1.063 | 0.971 | 0.894 |
| 4.319689898685836 | 1.062 | 0.972 | 0.895 |
| 4.322831491339426 | 1.061 | 0.972 | 0.897 |
| 4.325973083993015 | 1.06 | 0.972 | 0.898 |
| 4.329114676646605 | 1.059 | 0.973 | 0.899 |
| 4.332256269300195 | 1.058 | 0.973 | 0.901 |
| 4.335397861953784 | 1.057 | 0.974 | 0.902 |
| 4.338539454607374 | 1.056 | 0.974 | 0.904 |
| 4.341681047260963 | 1.055 | 0.974 | 0.905 |
| 4.344822639914553 | 1.054 | 0.975 | 0.906 |
| 4.347964232568143 | 1.054 | 0.975 | 0.908 |
| 4.351105825221732 | 1.053 | 0.976 | 0.909 |
| 4.354247417875322 | 1.052 | 0.976 | 0.91 |
| 4.357389010528911 | 1.051 | 0.976 | 0.912 |
| 4.360530603182501 | 1.05 | 0.977 | 0.913 |
| 4.36367219583609 | 1.049 | 0.977 | 0.915 |
| 4.36681378848968 | 1.048 | 0.978 | 0.916 |
| 4.36995538114327 | 1.047 | 0.978 | 0.917 |
| 4.373096973796859 | 1.046 | 0.978 | 0.919 |
| 4.376238566450449 | 1.046 | 0.979 | 0.92 |
| 4.379380159104038 | 1.045 | 0.979 | 0.921 |
| 4.382521751757628 | 1.044 | 0.979 | 0.923 |
| 4.385663344411217 | 1.043 | 0.98 | 0.924 |
| 4.388804937064807 | 1.042 | 0.98 | 0.925 |
| 4.391946529718397 | 1.041 | 0.981 | 0.926 |
| 4.395088122371987 | 1.041 | 0.981 | 0.928 |
| 4.398229715025576 | 1.04 | 0.981 | 0.929 |
| 4.401371307679165 | 1.039 | 0.982 | 0.93 |
| 4.404512900332755 | 1.038 | 0.982 | 0.932 |
| 4.407654492986345 | 1.037 | 0.982 | 0.933 |
| 4.410796085639934 | 1.037 | 0.983 | 0.934 |
| 4.413937678293524 | 1.036 | 0.983 | 0.935 |
| 4.417079270947114 | 1.035 | 0.983 | 0.937 |
| 4.420220863600703 | 1.034 | 0.984 | 0.938 |
| 4.423362456254293 | 1.034 | 0.984 | 0.939 |
| 4.426504048907883 | 1.033 | 0.984 | 0.94 |
| 4.429645641561472 | 1.032 | 0.985 | 0.941 |
| 4.432787234215062 | 1.031 | 0.985 | 0.943 |
| 4.435928826868651 | 1.031 | 0.985 | 0.944 |
| 4.43907041952224 | 1.03 | 0.986 | 0.945 |
| 4.44221201217583 | 1.029 | 0.986 | 0.946 |
| 4.44535360482942 | 1.029 | 0.986 | 0.947 |
| 4.44849519748301 | 1.028 | 0.987 | 0.948 |
| 4.4516367901366 | 1.027 | 0.987 | 0.95 |
| 4.454778382790188 | 1.027 | 0.987 | 0.951 |
| 4.457919975443779 | 1.026 | 0.987 | 0.952 |
| 4.461061568097368 | 1.025 | 0.988 | 0.953 |
| 4.464203160750958 | 1.025 | 0.988 | 0.954 |
| 4.467344753404547 | 1.024 | 0.988 | 0.955 |
| 4.470486346058137 | 1.023 | 0.989 | 0.956 |
| 4.473627938711726 | 1.023 | 0.989 | 0.957 |
| 4.476769531365316 | 1.022 | 0.989 | 0.958 |
| 4.479911124018905 | 1.022 | 0.989 | 0.959 |
| 4.483052716672495 | 1.021 | 0.99 | 0.96 |
| 4.486194309326085 | 1.021 | 0.99 | 0.961 |
| 4.489335901979674 | 1.02 | 0.99 | 0.962 |
| 4.492477494633264 | 1.019 | 0.991 | 0.963 |
| 4.495619087286854 | 1.019 | 0.991 | 0.964 |
| 4.498760679940443 | 1.018 | 0.991 | 0.965 |
| 4.501902272594033 | 1.018 | 0.991 | 0.966 |
| 4.505043865247622 | 1.017 | 0.992 | 0.967 |
| 4.508185457901212 | 1.017 | 0.992 | 0.968 |
| 4.511327050554801 | 1.016 | 0.992 | 0.969 |
| 4.514468643208391 | 1.016 | 0.992 | 0.97 |
| 4.517610235861981 | 1.015 | 0.993 | 0.971 |
| 4.520751828515571 | 1.015 | 0.993 | 0.972 |
| 4.52389342116916 | 1.014 | 0.993 | 0.973 |
| 4.52703501382275 | 1.014 | 0.993 | 0.974 |
| 4.530176606476339 | 1.013 | 0.993 | 0.974 |
| 4.533318199129928 | 1.013 | 0.994 | 0.975 |
| 4.536459791783518 | 1.012 | 0.994 | 0.976 |
| 4.539601384437108 | 1.012 | 0.994 | 0.977 |
| 4.542742977090698 | 1.012 | 0.994 | 0.978 |
| 4.545884569744287 | 1.011 | 0.995 | 0.978 |
| 4.549026162397876 | 1.011 | 0.995 | 0.979 |
| 4.552167755051466 | 1.01 | 0.995 | 0.98 |
| 4.555309347705056 | 1.01 | 0.995 | 0.981 |
| 4.558450940358646 | 1.009 | 0.995 | 0.982 |
| 4.561592533012235 | 1.009 | 0.996 | 0.982 |
| 4.564734125665825 | 1.009 | 0.996 | 0.983 |
| 4.567875718319415 | 1.008 | 0.996 | 0.984 |
| 4.571017310973004 | 1.008 | 0.996 | 0.984 |
| 4.574158903626594 | 1.008 | 0.996 | 0.985 |
| 4.577300496280183 | 1.007 | 0.996 | 0.986 |
| 4.580442088933772 | 1.007 | 0.997 | 0.986 |
| 4.583583681587362 | 1.007 | 0.997 | 0.987 |
| 4.586725274240952 | 1.006 | 0.997 | 0.988 |
| 4.589866866894542 | 1.006 | 0.997 | 0.988 |
| 4.593008459548131 | 1.006 | 0.997 | 0.989 |
| 4.596150052201721 | 1.005 | 0.997 | 0.989 |
| 4.59929164485531 | 1.005 | 0.997 | 0.99 |
| 4.6024332375089 | 1.005 | 0.998 | 0.99 |
| 4.60557483016249 | 1.005 | 0.998 | 0.991 |
| 4.608716422816079 | 1.004 | 0.998 | 0.992 |
| 4.611858015469668 | 1.004 | 0.998 | 0.992 |
| 4.614999608123258 | 1.004 | 0.998 | 0.992 |
| 4.618141200776848 | 1.004 | 0.998 | 0.993 |
| 4.621282793430437 | 1.003 | 0.998 | 0.993 |
| 4.624424386084027 | 1.003 | 0.998 | 0.994 |
| 4.627565978737617 | 1.003 | 0.999 | 0.994 |
| 4.630707571391206 | 1.003 | 0.999 | 0.995 |
| 4.633849164044795 | 1.002 | 0.999 | 0.995 |
| 4.636990756698386 | 1.002 | 0.999 | 0.995 |
| 4.640132349351975 | 1.002 | 0.999 | 0.996 |
| 4.643273942005564 | 1.002 | 0.999 | 0.996 |
| 4.646415534659154 | 1.002 | 0.999 | 0.997 |
| 4.649557127312744 | 1.002 | 0.999 | 0.997 |
| 4.652698719966334 | 1.001 | 0.999 | 0.997 |
| 4.655840312619923 | 1.001 | 0.999 | 0.997 |
| 4.658981905273513 | 1.001 | 0.999 | 0.998 |
| 4.662123497927102 | 1.001 | 0.999 | 0.998 |
| 4.665265090580692 | 1.001 | 1 | 0.998 |
| 4.668406683234282 | 1.001 | 1 | 0.998 |
| 4.671548275887871 | 1.001 | 1 | 0.999 |
| 4.674689868541461 | 1.001 | 1 | 0.999 |
| 4.67783146119505 | 1 | 1 | 0.999 |
| 4.68097305384864 | 1 | 1 | 0.999 |
| 4.68411464650223 | 1 | 1 | 0.999 |
| 4.687256239155819 | 1 | 1 | 0.999 |
| 4.690397831809409 | 1 | 1 | 1 |
| 4.693539424462998 | 1 | 1 | 1 |
| 4.696681017116588 | 1 | 1 | 1 |
| 4.699822609770177 | 1 | 1 | 1 |
| 4.702964202423767 | 1 | 1 | 1 |
| 4.706105795077356 | 1 | 1 | 1 |
| 4.709247387730946 | 1 | 1 | 1 |
| 4.712388980384535 | 1 | 1 | 1 |
| 4.715530573038126 | 1 | 1 | 1 |
| 4.718672165691715 | 1 | 1 | 1 |
| 4.721813758345305 | 1 | 1 | 1 |
| 4.724955350998894 | 1 | 1 | 1 |
| 4.728096943652484 | 1 | 1 | 1 |
| 4.731238536306074 | 1 | 1 | 1 |
| 4.734380128959663 | 1 | 1 | 1 |
| 4.737521721613253 | 1 | 1 | 0.999 |
| 4.740663314266842 | 1 | 1 | 0.999 |
| 4.743804906920432 | 1 | 1 | 0.999 |
| 4.74694649957402 | 1 | 1 | 0.999 |
| 4.750088092227611 | 1.001 | 1 | 0.999 |
| 4.7532296848812 | 1.001 | 1 | 0.999 |
| 4.75637127753479 | 1.001 | 1 | 0.998 |
| 4.75951287018838 | 1.001 | 1 | 0.998 |
| 4.76265446284197 | 1.001 | 0.999 | 0.998 |
| 4.765796055495559 | 1.001 | 0.999 | 0.998 |
| 4.768937648149149 | 1.001 | 0.999 | 0.997 |
| 4.772079240802738 | 1.001 | 0.999 | 0.997 |
| 4.775220833456327 | 1.002 | 0.999 | 0.997 |
| 4.778362426109917 | 1.002 | 0.999 | 0.997 |
| 4.781504018763507 | 1.002 | 0.999 | 0.996 |
| 4.784645611417097 | 1.002 | 0.999 | 0.996 |
| 4.787787204070686 | 1.002 | 0.999 | 0.995 |
| 4.790928796724275 | 1.002 | 0.999 | 0.995 |
| 4.794070389377865 | 1.003 | 0.999 | 0.995 |
| 4.797211982031455 | 1.003 | 0.999 | 0.994 |
| 4.800353574685045 | 1.003 | 0.998 | 0.994 |
| 4.803495167338634 | 1.003 | 0.998 | 0.993 |
| 4.806636759992224 | 1.004 | 0.998 | 0.993 |
| 4.809778352645814 | 1.004 | 0.998 | 0.992 |
| 4.812919945299403 | 1.004 | 0.998 | 0.992 |
| 4.816061537952993 | 1.004 | 0.998 | 0.992 |
| 4.819203130606582 | 1.005 | 0.998 | 0.991 |
| 4.822344723260172 | 1.005 | 0.998 | 0.99 |
| 4.825486315913761 | 1.005 | 0.997 | 0.99 |
| 4.828627908567351 | 1.005 | 0.997 | 0.989 |
| 4.83176950122094 | 1.006 | 0.997 | 0.989 |
| 4.83491109387453 | 1.006 | 0.997 | 0.988 |
| 4.83805268652812 | 1.006 | 0.997 | 0.988 |
| 4.841194279181709 | 1.007 | 0.997 | 0.987 |
| 4.844335871835299 | 1.007 | 0.997 | 0.986 |
| 4.847477464488889 | 1.007 | 0.996 | 0.986 |
| 4.850619057142478 | 1.008 | 0.996 | 0.985 |
| 4.853760649796068 | 1.008 | 0.996 | 0.984 |
| 4.856902242449657 | 1.008 | 0.996 | 0.984 |
| 4.860043835103247 | 1.009 | 0.996 | 0.983 |
| 4.863185427756837 | 1.009 | 0.996 | 0.982 |
| 4.866327020410426 | 1.009 | 0.995 | 0.982 |
| 4.869468613064015 | 1.01 | 0.995 | 0.981 |
| 4.872610205717605 | 1.01 | 0.995 | 0.98 |
| 4.875751798371195 | 1.011 | 0.995 | 0.979 |
| 4.878893391024784 | 1.011 | 0.995 | 0.978 |
| 4.882034983678374 | 1.012 | 0.994 | 0.978 |
| 4.885176576331964 | 1.012 | 0.994 | 0.977 |
| 4.888318168985553 | 1.012 | 0.994 | 0.976 |
| 4.891459761639143 | 1.013 | 0.994 | 0.975 |
| 4.894601354292733 | 1.013 | 0.993 | 0.974 |
| 4.897742946946322 | 1.014 | 0.993 | 0.974 |
| 4.900884539599912 | 1.014 | 0.993 | 0.973 |
| 4.904026132253501 | 1.015 | 0.993 | 0.972 |
| 4.907167724907091 | 1.015 | 0.993 | 0.971 |
| 4.91030931756068 | 1.016 | 0.992 | 0.97 |
| 4.91345091021427 | 1.016 | 0.992 | 0.969 |
| 4.91659250286786 | 1.017 | 0.992 | 0.968 |
| 4.91973409552145 | 1.017 | 0.992 | 0.967 |
| 4.922875688175039 | 1.018 | 0.991 | 0.966 |
| 4.926017280828628 | 1.018 | 0.991 | 0.965 |
| 4.929158873482218 | 1.019 | 0.991 | 0.964 |
| 4.932300466135808 | 1.019 | 0.991 | 0.963 |
| 4.935442058789397 | 1.02 | 0.99 | 0.962 |
| 4.938583651442987 | 1.021 | 0.99 | 0.961 |
| 4.941725244096576 | 1.021 | 0.99 | 0.96 |
| 4.944866836750166 | 1.022 | 0.989 | 0.959 |
| 4.948008429403755 | 1.022 | 0.989 | 0.958 |
| 4.951150022057345 | 1.023 | 0.989 | 0.957 |
| 4.954291614710935 | 1.023 | 0.989 | 0.956 |
| 4.957433207364524 | 1.024 | 0.988 | 0.955 |
| 4.960574800018114 | 1.025 | 0.988 | 0.954 |
| 4.963716392671704 | 1.025 | 0.988 | 0.953 |
| 4.966857985325293 | 1.026 | 0.987 | 0.952 |
| 4.969999577978883 | 1.027 | 0.987 | 0.951 |
| 4.973141170632472 | 1.027 | 0.987 | 0.95 |
| 4.976282763286062 | 1.028 | 0.987 | 0.948 |
| 4.979424355939651 | 1.029 | 0.986 | 0.947 |
| 4.982565948593241 | 1.029 | 0.986 | 0.946 |
| 4.985707541246831 | 1.03 | 0.986 | 0.945 |
| 4.98884913390042 | 1.031 | 0.985 | 0.944 |
| 4.99199072655401 | 1.031 | 0.985 | 0.943 |
| 4.9951323192076 | 1.032 | 0.985 | 0.941 |
| 4.99827391186119 | 1.033 | 0.984 | 0.94 |
| 5.00141550451478 | 1.034 | 0.984 | 0.939 |
| 5.004557097168369 | 1.034 | 0.984 | 0.938 |
| 5.007698689821958 | 1.035 | 0.983 | 0.937 |
| 5.010840282475548 | 1.036 | 0.983 | 0.935 |
| 5.013981875129137 | 1.037 | 0.983 | 0.934 |
| 5.017123467782727 | 1.037 | 0.982 | 0.933 |
| 5.020265060436317 | 1.038 | 0.982 | 0.932 |
| 5.023406653089906 | 1.039 | 0.982 | 0.93 |
| 5.026548245743496 | 1.04 | 0.981 | 0.929 |
| 5.029689838397085 | 1.041 | 0.981 | 0.928 |
| 5.032831431050674 | 1.041 | 0.981 | 0.926 |
| 5.035973023704264 | 1.042 | 0.98 | 0.925 |
| 5.039114616357854 | 1.043 | 0.98 | 0.924 |
| 5.042256209011444 | 1.044 | 0.979 | 0.923 |
| 5.045397801665033 | 1.045 | 0.979 | 0.921 |
| 5.048539394318622 | 1.046 | 0.979 | 0.92 |
| 5.051680986972213 | 1.046 | 0.978 | 0.919 |
| 5.054822579625802 | 1.047 | 0.978 | 0.917 |
| 5.057964172279392 | 1.048 | 0.978 | 0.916 |
| 5.061105764932981 | 1.049 | 0.977 | 0.915 |
| 5.064247357586571 | 1.05 | 0.977 | 0.913 |
| 5.067388950240161 | 1.051 | 0.976 | 0.912 |
| 5.07053054289375 | 1.052 | 0.976 | 0.91 |
| 5.07367213554734 | 1.053 | 0.976 | 0.909 |
| 5.07681372820093 | 1.054 | 0.975 | 0.908 |
| 5.079955320854519 | 1.054 | 0.975 | 0.906 |
| 5.083096913508108 | 1.055 | 0.974 | 0.905 |
| 5.086238506161698 | 1.056 | 0.974 | 0.904 |
| 5.089380098815288 | 1.057 | 0.974 | 0.902 |
| 5.092521691468877 | 1.058 | 0.973 | 0.901 |
| 5.095663284122466 | 1.059 | 0.973 | 0.899 |
| 5.098804876776057 | 1.06 | 0.972 | 0.898 |
| 5.101946469429646 | 1.061 | 0.972 | 0.897 |
| 5.105088062083236 | 1.062 | 0.972 | 0.895 |
| 5.108229654736825 | 1.063 | 0.971 | 0.894 |
| 5.111371247390415 | 1.064 | 0.971 | 0.892 |
| 5.114512840044005 | 1.065 | 0.97 | 0.891 |
| 5.117654432697594 | 1.066 | 0.97 | 0.889 |
| 5.120796025351184 | 1.067 | 0.969 | 0.888 |
| 5.123937618004773 | 1.068 | 0.969 | 0.887 |
| 5.127079210658363 | 1.069 | 0.969 | 0.885 |
| 5.130220803311953 | 1.071 | 0.968 | 0.884 |
| 5.133362395965542 | 1.072 | 0.968 | 0.882 |
| 5.136503988619131 | 1.073 | 0.967 | 0.881 |
| 5.13964558127272 | 1.074 | 0.967 | 0.879 |
| 5.142787173926311 | 1.075 | 0.966 | 0.878 |
| 5.1459287665799 | 1.076 | 0.966 | 0.876 |
| 5.14907035923349 | 1.077 | 0.965 | 0.875 |
| 5.15221195188708 | 1.078 | 0.965 | 0.873 |
| 5.15535354454067 | 1.079 | 0.965 | 0.872 |
| 5.158495137194259 | 1.08 | 0.964 | 0.87 |
| 5.161636729847848 | 1.082 | 0.964 | 0.869 |
| 5.164778322501438 | 1.083 | 0.963 | 0.867 |
| 5.167919915155028 | 1.084 | 0.963 | 0.866 |
| 5.171061507808617 | 1.085 | 0.962 | 0.864 |
| 5.174203100462206 | 1.086 | 0.962 | 0.863 |
| 5.177344693115796 | 1.087 | 0.961 | 0.861 |
| 5.180486285769386 | 1.089 | 0.961 | 0.86 |
| 5.183627878422976 | 1.09 | 0.96 | 0.858 |
| 5.186769471076565 | 1.091 | 0.96 | 0.857 |
| 5.189911063730155 | 1.092 | 0.959 | 0.855 |
| 5.193052656383744 | 1.094 | 0.959 | 0.854 |
| 5.196194249037334 | 1.095 | 0.959 | 0.852 |
| 5.199335841690924 | 1.096 | 0.958 | 0.851 |
| 5.202477434344513 | 1.097 | 0.958 | 0.849 |
| 5.205619026998103 | 1.099 | 0.957 | 0.848 |
| 5.208760619651692 | 1.1 | 0.957 | 0.846 |
| 5.211902212305282 | 1.101 | 0.956 | 0.845 |
| 5.215043804958871 | 1.102 | 0.956 | 0.843 |
| 5.218185397612461 | 1.104 | 0.955 | 0.842 |
| 5.221326990266051 | 1.105 | 0.955 | 0.84 |
| 5.22446858291964 | 1.106 | 0.954 | 0.839 |
| 5.22761017557323 | 1.108 | 0.954 | 0.837 |
| 5.23075176822682 | 1.109 | 0.953 | 0.836 |
| 5.23389336088041 | 1.11 | 0.953 | 0.834 |
| 5.237034953533999 | 1.112 | 0.952 | 0.833 |
| 5.240176546187588 | 1.113 | 0.952 | 0.831 |
| 5.243318138841178 | 1.114 | 0.951 | 0.83 |
| 5.246459731494767 | 1.116 | 0.951 | 0.828 |
| 5.249601324148357 | 1.117 | 0.95 | 0.827 |
| 5.252742916801947 | 1.118 | 0.95 | 0.825 |
| 5.255884509455536 | 1.12 | 0.949 | 0.824 |
| 5.259026102109125 | 1.121 | 0.949 | 0.822 |
| 5.262167694762715 | 1.123 | 0.948 | 0.821 |
| 5.265309287416305 | 1.124 | 0.948 | 0.819 |
| 5.268450880069895 | 1.125 | 0.947 | 0.818 |
| 5.271592472723484 | 1.127 | 0.947 | 0.816 |
| 5.274734065377074 | 1.128 | 0.946 | 0.815 |
| 5.277875658030664 | 1.13 | 0.946 | 0.813 |
| 5.281017250684253 | 1.131 | 0.945 | 0.812 |
| 5.284158843337843 | 1.133 | 0.945 | 0.81 |
| 5.287300435991432 | 1.134 | 0.944 | 0.809 |
| 5.290442028645022 | 1.136 | 0.944 | 0.807 |
| 5.293583621298612 | 1.137 | 0.943 | 0.806 |
| 5.296725213952201 | 1.139 | 0.943 | 0.804 |
| 5.299866806605791 | 1.14 | 0.942 | 0.803 |
| 5.30300839925938 | 1.142 | 0.942 | 0.801 |
| 5.30614999191297 | 1.143 | 0.941 | 0.8 |
| 5.30929158456656 | 1.145 | 0.941 | 0.798 |
| 5.312433177220149 | 1.146 | 0.94 | 0.797 |
| 5.315574769873739 | 1.148 | 0.94 | 0.795 |
| 5.318716362527328 | 1.149 | 0.939 | 0.794 |
| 5.321857955180918 | 1.151 | 0.938 | 0.792 |
| 5.324999547834508 | 1.152 | 0.938 | 0.791 |
| 5.328141140488097 | 1.154 | 0.937 | 0.789 |
| 5.331282733141686 | 1.156 | 0.937 | 0.788 |
| 5.334424325795276 | 1.157 | 0.936 | 0.786 |
| 5.337565918448866 | 1.159 | 0.936 | 0.785 |
| 5.340707511102456 | 1.16 | 0.935 | 0.783 |
| 5.343849103756045 | 1.162 | 0.935 | 0.782 |
| 5.346990696409634 | 1.164 | 0.934 | 0.781 |
| 5.350132289063224 | 1.165 | 0.934 | 0.779 |
| 5.353273881716814 | 1.167 | 0.933 | 0.778 |
| 5.356415474370403 | 1.168 | 0.933 | 0.776 |
| 5.359557067023993 | 1.17 | 0.932 | 0.775 |
| 5.362698659677583 | 1.172 | 0.932 | 0.773 |
| 5.365840252331172 | 1.173 | 0.931 | 0.772 |
| 5.368981844984762 | 1.175 | 0.931 | 0.77 |
| 5.372123437638351 | 1.177 | 0.93 | 0.769 |
| 5.375265030291941 | 1.179 | 0.93 | 0.767 |
| 5.378406622945531 | 1.18 | 0.929 | 0.766 |
| 5.38154821559912 | 1.182 | 0.929 | 0.765 |
| 5.38468980825271 | 1.184 | 0.928 | 0.763 |
| 5.387831400906299 | 1.185 | 0.927 | 0.762 |
| 5.39097299355989 | 1.187 | 0.927 | 0.76 |
| 5.394114586213479 | 1.189 | 0.926 | 0.759 |
| 5.397256178867068 | 1.191 | 0.926 | 0.758 |
| 5.400397771520657 | 1.192 | 0.925 | 0.756 |
| 5.403539364174247 | 1.194 | 0.925 | 0.755 |
| 5.406680956827837 | 1.196 | 0.924 | 0.753 |
| 5.409822549481426 | 1.198 | 0.924 | 0.752 |
| 5.412964142135016 | 1.199 | 0.923 | 0.75 |
| 5.416105734788605 | 1.201 | 0.923 | 0.749 |
| 5.419247327442195 | 1.203 | 0.922 | 0.748 |
| 5.422388920095785 | 1.205 | 0.922 | 0.746 |
| 5.425530512749375 | 1.207 | 0.921 | 0.745 |
| 5.428672105402964 | 1.208 | 0.921 | 0.744 |
| 5.431813698056554 | 1.21 | 0.92 | 0.742 |
| 5.434955290710143 | 1.212 | 0.92 | 0.741 |
| 5.438096883363733 | 1.214 | 0.919 | 0.739 |
| 5.441238476017322 | 1.216 | 0.919 | 0.738 |
| 5.444380068670912 | 1.218 | 0.918 | 0.737 |
| 5.447521661324502 | 1.219 | 0.917 | 0.735 |
| 5.450663253978091 | 1.221 | 0.917 | 0.734 |
| 5.453804846631681 | 1.223 | 0.916 | 0.733 |
| 5.456946439285271 | 1.225 | 0.916 | 0.731 |
| 5.46008803193886 | 1.227 | 0.915 | 0.73 |
| 5.46322962459245 | 1.229 | 0.915 | 0.729 |
| 5.466371217246039 | 1.231 | 0.914 | 0.727 |
| 5.46951280989963 | 1.233 | 0.914 | 0.726 |
| 5.472654402553218 | 1.234 | 0.913 | 0.725 |
| 5.475795995206808 | 1.236 | 0.913 | 0.723 |
| 5.478937587860398 | 1.238 | 0.912 | 0.722 |
| 5.482079180513987 | 1.24 | 0.912 | 0.721 |
| 5.485220773167577 | 1.242 | 0.911 | 0.719 |
| 5.488362365821166 | 1.244 | 0.911 | 0.718 |
| 5.491503958474756 | 1.246 | 0.91 | 0.717 |
| 5.494645551128346 | 1.248 | 0.91 | 0.716 |
| 5.497787143781935 | 1.25 | 0.909 | 0.714 |
| 5.500928736435525 | 1.252 | 0.909 | 0.713 |
| 5.504070329089115 | 1.254 | 0.908 | 0.712 |
| 5.507211921742704 | 1.256 | 0.908 | 0.71 |
| 5.510353514396294 | 1.258 | 0.907 | 0.709 |
| 5.513495107049883 | 1.26 | 0.907 | 0.708 |
| 5.516636699703473 | 1.262 | 0.906 | 0.707 |
| 5.519778292357062 | 1.264 | 0.905 | 0.705 |
| 5.522919885010652 | 1.266 | 0.905 | 0.704 |
| 5.526061477664242 | 1.268 | 0.904 | 0.703 |
| 5.529203070317831 | 1.27 | 0.904 | 0.702 |
| 5.532344662971421 | 1.272 | 0.903 | 0.7 |
| 5.535486255625011 | 1.274 | 0.903 | 0.699 |
| 5.5386278482786 | 1.276 | 0.902 | 0.698 |
| 5.54176944093219 | 1.278 | 0.902 | 0.697 |
| 5.544911033585779 | 1.28 | 0.901 | 0.696 |
| 5.54805262623937 | 1.282 | 0.901 | 0.694 |
| 5.551194218892959 | 1.284 | 0.9 | 0.693 |
| 5.554335811546548 | 1.286 | 0.9 | 0.692 |
| 5.557477404200137 | 1.288 | 0.899 | 0.691 |
| 5.560618996853727 | 1.29 | 0.899 | 0.69 |
| 5.563760589507317 | 1.293 | 0.898 | 0.688 |
| 5.566902182160906 | 1.295 | 0.898 | 0.687 |
| 5.570043774814496 | 1.297 | 0.897 | 0.686 |
| 5.573185367468086 | 1.299 | 0.897 | 0.685 |
| 5.576326960121675 | 1.301 | 0.896 | 0.684 |
| 5.579468552775264 | 1.303 | 0.896 | 0.683 |
| 5.582610145428854 | 1.305 | 0.895 | 0.681 |
| 5.585751738082444 | 1.307 | 0.895 | 0.68 |
| 5.588893330736034 | 1.309 | 0.894 | 0.679 |
| 5.592034923389623 | 1.311 | 0.894 | 0.678 |
| 5.595176516043213 | 1.314 | 0.893 | 0.677 |
| 5.598318108696803 | 1.316 | 0.893 | 0.676 |
| 5.601459701350392 | 1.318 | 0.892 | 0.675 |
| 5.604601294003982 | 1.32 | 0.892 | 0.673 |
| 5.607742886657571 | 1.322 | 0.891 | 0.672 |
| 5.610884479311161 | 1.324 | 0.891 | 0.671 |
| 5.61402607196475 | 1.326 | 0.89 | 0.67 |
| 5.61716766461834 | 1.329 | 0.89 | 0.669 |
| 5.62030925727193 | 1.331 | 0.889 | 0.668 |
| 5.623450849925519 | 1.333 | 0.889 | 0.667 |
| 5.626592442579109 | 1.335 | 0.889 | 0.666 |
| 5.629734035232698 | 1.337 | 0.888 | 0.665 |
| 5.632875627886288 | 1.339 | 0.888 | 0.664 |
| 5.636017220539878 | 1.342 | 0.887 | 0.663 |
| 5.639158813193467 | 1.344 | 0.887 | 0.662 |
| 5.642300405847057 | 1.346 | 0.886 | 0.66 |
| 5.645441998500646 | 1.348 | 0.886 | 0.659 |
| 5.648583591154236 | 1.35 | 0.885 | 0.658 |
| 5.651725183807825 | 1.352 | 0.885 | 0.657 |
| 5.654866776461415 | 1.355 | 0.884 | 0.656 |
| 5.658008369115005 | 1.357 | 0.884 | 0.655 |
| 5.661149961768594 | 1.359 | 0.883 | 0.654 |
| 5.664291554422184 | 1.361 | 0.883 | 0.653 |
| 5.667433147075774 | 1.363 | 0.882 | 0.652 |
| 5.670574739729363 | 1.366 | 0.882 | 0.651 |
| 5.673716332382953 | 1.368 | 0.881 | 0.65 |
| 5.676857925036542 | 1.37 | 0.881 | 0.649 |
| 5.679999517690132 | 1.372 | 0.881 | 0.648 |
| 5.683141110343721 | 1.374 | 0.88 | 0.647 |
| 5.686282702997311 | 1.377 | 0.88 | 0.646 |
| 5.689424295650901 | 1.379 | 0.879 | 0.645 |
| 5.69256588830449 | 1.381 | 0.879 | 0.644 |
| 5.69570748095808 | 1.383 | 0.878 | 0.643 |
| 5.69884907361167 | 1.386 | 0.878 | 0.642 |
| 5.701990666265259 | 1.388 | 0.877 | 0.641 |
| 5.705132258918849 | 1.39 | 0.877 | 0.641 |
| 5.708273851572438 | 1.392 | 0.877 | 0.64 |
| 5.711415444226028 | 1.394 | 0.876 | 0.639 |
| 5.714557036879618 | 1.397 | 0.876 | 0.638 |
| 5.717698629533207 | 1.399 | 0.875 | 0.637 |
| 5.720840222186797 | 1.401 | 0.875 | 0.636 |
| 5.723981814840386 | 1.403 | 0.874 | 0.635 |
| 5.727123407493976 | 1.406 | 0.874 | 0.634 |
| 5.730265000147565 | 1.408 | 0.873 | 0.633 |
| 5.733406592801155 | 1.41 | 0.873 | 0.632 |
| 5.736548185454744 | 1.412 | 0.873 | 0.631 |
| 5.739689778108334 | 1.414 | 0.872 | 0.63 |
| 5.742831370761924 | 1.417 | 0.872 | 0.63 |
| 5.745972963415514 | 1.419 | 0.871 | 0.629 |
| 5.749114556069103 | 1.421 | 0.871 | 0.628 |
| 5.752256148722693 | 1.423 | 0.871 | 0.627 |
| 5.755397741376282 | 1.426 | 0.87 | 0.626 |
| 5.758539334029872 | 1.428 | 0.87 | 0.625 |
| 5.761680926683462 | 1.43 | 0.869 | 0.624 |
| 5.764822519337051 | 1.432 | 0.869 | 0.624 |
| 5.767964111990641 | 1.434 | 0.868 | 0.623 |
| 5.77110570464423 | 1.437 | 0.868 | 0.622 |
| 5.77424729729782 | 1.439 | 0.868 | 0.621 |
| 5.77738888995141 | 1.441 | 0.867 | 0.62 |
| 5.780530482605 | 1.443 | 0.867 | 0.619 |
| 5.783672075258588 | 1.446 | 0.866 | 0.619 |
| 5.786813667912178 | 1.448 | 0.866 | 0.618 |
| 5.789955260565768 | 1.45 | 0.866 | 0.617 |
| 5.793096853219358 | 1.452 | 0.865 | 0.616 |
| 5.796238445872947 | 1.454 | 0.865 | 0.615 |
| 5.799380038526537 | 1.457 | 0.865 | 0.615 |
| 5.802521631180126 | 1.459 | 0.864 | 0.614 |
| 5.805663223833715 | 1.461 | 0.864 | 0.613 |
| 5.808804816487306 | 1.463 | 0.863 | 0.612 |
| 5.811946409140895 | 1.465 | 0.863 | 0.612 |
| 5.815088001794485 | 1.468 | 0.863 | 0.611 |
| 5.818229594448074 | 1.47 | 0.862 | 0.61 |
| 5.821371187101663 | 1.472 | 0.862 | 0.609 |
| 5.824512779755254 | 1.474 | 0.861 | 0.609 |
| 5.827654372408843 | 1.476 | 0.861 | 0.608 |
| 5.830795965062433 | 1.478 | 0.861 | 0.607 |
| 5.833937557716022 | 1.481 | 0.86 | 0.606 |
| 5.837079150369612 | 1.483 | 0.86 | 0.606 |
| 5.840220743023201 | 1.485 | 0.86 | 0.605 |
| 5.843362335676791 | 1.487 | 0.859 | 0.604 |
| 5.846503928330381 | 1.489 | 0.859 | 0.604 |
| 5.84964552098397 | 1.491 | 0.859 | 0.603 |
| 5.85278711363756 | 1.493 | 0.858 | 0.602 |
| 5.85592870629115 | 1.495 | 0.858 | 0.601 |
| 5.85907029894474 | 1.498 | 0.858 | 0.601 |
| 5.862211891598329 | 1.5 | 0.857 | 0.6 |
| 5.865353484251918 | 1.502 | 0.857 | 0.599 |
| 5.868495076905508 | 1.504 | 0.857 | 0.599 |
| 5.871636669559098 | 1.506 | 0.856 | 0.598 |
| 5.874778262212687 | 1.508 | 0.856 | 0.597 |
| 5.877919854866277 | 1.51 | 0.855 | 0.597 |
| 5.881061447519866 | 1.512 | 0.855 | 0.596 |
| 5.884203040173456 | 1.514 | 0.855 | 0.595 |
| 5.887344632827046 | 1.516 | 0.855 | 0.595 |
| 5.890486225480635 | 1.518 | 0.854 | 0.594 |
| 5.893627818134224 | 1.52 | 0.854 | 0.594 |
| 5.896769410787814 | 1.523 | 0.854 | 0.593 |
| 5.899911003441404 | 1.525 | 0.853 | 0.592 |
| 5.903052596094994 | 1.527 | 0.853 | 0.592 |
| 5.906194188748583 | 1.529 | 0.853 | 0.591 |
| 5.909335781402172 | 1.531 | 0.852 | 0.591 |
| 5.912477374055762 | 1.533 | 0.852 | 0.59 |
| 5.915618966709352 | 1.535 | 0.852 | 0.589 |
| 5.918760559362942 | 1.537 | 0.851 | 0.589 |
| 5.921902152016531 | 1.539 | 0.851 | 0.588 |
| 5.92504374467012 | 1.54 | 0.851 | 0.588 |
| 5.92818533732371 | 1.542 | 0.85 | 0.587 |
| 5.9313269299773 | 1.544 | 0.85 | 0.587 |
| 5.93446852263089 | 1.546 | 0.85 | 0.586 |
| 5.93761011528448 | 1.548 | 0.85 | 0.585 |
| 5.940751707938068 | 1.55 | 0.849 | 0.585 |
| 5.943893300591658 | 1.552 | 0.849 | 0.584 |
| 5.947034893245248 | 1.554 | 0.849 | 0.584 |
| 5.950176485898837 | 1.556 | 0.848 | 0.583 |
| 5.953318078552427 | 1.558 | 0.848 | 0.583 |
| 5.956459671206017 | 1.56 | 0.848 | 0.582 |
| 5.959601263859606 | 1.561 | 0.848 | 0.582 |
| 5.962742856513196 | 1.563 | 0.847 | 0.581 |
| 5.965884449166785 | 1.565 | 0.847 | 0.581 |
| 5.969026041820375 | 1.567 | 0.847 | 0.58 |
| 5.972167634473964 | 1.569 | 0.847 | 0.58 |
| 5.975309227127554 | 1.571 | 0.846 | 0.579 |
| 5.978450819781144 | 1.572 | 0.846 | 0.579 |
| 5.981592412434733 | 1.574 | 0.846 | 0.578 |
| 5.984734005088323 | 1.576 | 0.846 | 0.578 |
| 5.987875597741913 | 1.578 | 0.845 | 0.577 |
| 5.991017190395502 | 1.579 | 0.845 | 0.577 |
| 5.994158783049092 | 1.581 | 0.845 | 0.576 |
| 5.997300375702681 | 1.583 | 0.845 | 0.576 |
| 6.000441968356271 | 1.584 | 0.844 | 0.575 |
| 6.003583561009861 | 1.586 | 0.844 | 0.575 |
| 6.00672515366345 | 1.588 | 0.844 | 0.575 |
| 6.00986674631704 | 1.589 | 0.844 | 0.574 |
| 6.01300833897063 | 1.591 | 0.843 | 0.574 |
| 6.01614993162422 | 1.593 | 0.843 | 0.573 |
| 6.019291524277808 | 1.594 | 0.843 | 0.573 |
| 6.022433116931398 | 1.596 | 0.843 | 0.572 |
| 6.025574709584988 | 1.598 | 0.842 | 0.572 |
| 6.028716302238577 | 1.599 | 0.842 | 0.572 |
| 6.031857894892167 | 1.601 | 0.842 | 0.571 |
| 6.034999487545757 | 1.602 | 0.842 | 0.571 |
| 6.038141080199346 | 1.604 | 0.842 | 0.57 |
| 6.041282672852935 | 1.605 | 0.841 | 0.57 |
| 6.044424265506525 | 1.607 | 0.841 | 0.57 |
| 6.047565858160115 | 1.608 | 0.841 | 0.569 |
| 6.050707450813704 | 1.61 | 0.841 | 0.569 |
| 6.053849043467294 | 1.611 | 0.841 | 0.569 |
| 6.056990636120884 | 1.613 | 0.84 | 0.568 |
| 6.060132228774473 | 1.614 | 0.84 | 0.568 |
| 6.063273821428063 | 1.615 | 0.84 | 0.568 |
| 6.066415414081653 | 1.617 | 0.84 | 0.567 |
| 6.069557006735242 | 1.618 | 0.84 | 0.567 |
| 6.072698599388831 | 1.62 | 0.839 | 0.567 |
| 6.07584019204242 | 1.621 | 0.839 | 0.566 |
| 6.078981784696011 | 1.622 | 0.839 | 0.566 |
| 6.082123377349601 | 1.623 | 0.839 | 0.566 |
| 6.08526497000319 | 1.625 | 0.839 | 0.565 |
| 6.08840656265678 | 1.626 | 0.839 | 0.565 |
| 6.09154815531037 | 1.627 | 0.838 | 0.565 |
| 6.094689747963959 | 1.629 | 0.838 | 0.564 |
| 6.097831340617549 | 1.63 | 0.838 | 0.564 |
| 6.100972933271138 | 1.631 | 0.838 | 0.564 |
| 6.104114525924728 | 1.632 | 0.838 | 0.564 |
| 6.107256118578317 | 1.633 | 0.838 | 0.563 |
| 6.110397711231907 | 1.634 | 0.837 | 0.563 |
| 6.113539303885497 | 1.636 | 0.837 | 0.563 |
| 6.116680896539086 | 1.637 | 0.837 | 0.562 |
| 6.119822489192675 | 1.638 | 0.837 | 0.562 |
| 6.122964081846265 | 1.639 | 0.837 | 0.562 |
| 6.126105674499855 | 1.64 | 0.837 | 0.562 |
| 6.129247267153445 | 1.641 | 0.837 | 0.561 |
| 6.132388859807034 | 1.642 | 0.836 | 0.561 |
| 6.135530452460624 | 1.643 | 0.836 | 0.561 |
| 6.138672045114213 | 1.644 | 0.836 | 0.561 |
| 6.141813637767803 | 1.645 | 0.836 | 0.561 |
| 6.144955230421393 | 1.646 | 0.836 | 0.56 |
| 6.148096823074982 | 1.647 | 0.836 | 0.56 |
| 6.151238415728571 | 1.648 | 0.836 | 0.56 |
| 6.154380008382161 | 1.649 | 0.836 | 0.56 |
| 6.157521601035751 | 1.649 | 0.836 | 0.559 |
| 6.16066319368934 | 1.65 | 0.835 | 0.559 |
| 6.16380478634293 | 1.651 | 0.835 | 0.559 |
| 6.16694637899652 | 1.652 | 0.835 | 0.559 |
| 6.170087971650109 | 1.653 | 0.835 | 0.559 |
| 6.173229564303698 | 1.653 | 0.835 | 0.559 |
| 6.176371156957289 | 1.654 | 0.835 | 0.558 |
| 6.179512749610878 | 1.655 | 0.835 | 0.558 |
| 6.182654342264468 | 1.656 | 0.835 | 0.558 |
| 6.185795934918057 | 1.656 | 0.835 | 0.558 |
| 6.188937527571647 | 1.657 | 0.835 | 0.558 |
| 6.192079120225237 | 1.658 | 0.834 | 0.558 |
| 6.195220712878826 | 1.658 | 0.834 | 0.557 |
| 6.198362305532415 | 1.659 | 0.834 | 0.557 |
| 6.201503898186005 | 1.659 | 0.834 | 0.557 |
| 6.204645490839594 | 1.66 | 0.834 | 0.557 |
| 6.207787083493184 | 1.66 | 0.834 | 0.557 |
| 6.210928676146774 | 1.661 | 0.834 | 0.557 |
| 6.214070268800364 | 1.661 | 0.834 | 0.557 |
| 6.217211861453953 | 1.662 | 0.834 | 0.557 |
| 6.220353454107543 | 1.662 | 0.834 | 0.557 |
| 6.223495046761133 | 1.663 | 0.834 | 0.556 |
| 6.226636639414722 | 1.663 | 0.834 | 0.556 |
| 6.229778232068312 | 1.664 | 0.834 | 0.556 |
| 6.232919824721901 | 1.664 | 0.834 | 0.556 |
| 6.236061417375491 | 1.664 | 0.834 | 0.556 |
| 6.23920301002908 | 1.665 | 0.834 | 0.556 |
| 6.24234460268267 | 1.665 | 0.834 | 0.556 |
| 6.24548619533626 | 1.665 | 0.834 | 0.556 |
| 6.24862778798985 | 1.665 | 0.833 | 0.556 |
| 6.251769380643438 | 1.666 | 0.833 | 0.556 |
| 6.254910973297028 | 1.666 | 0.833 | 0.556 |
| 6.258052565950618 | 1.666 | 0.833 | 0.556 |
| 6.261194158604208 | 1.666 | 0.833 | 0.556 |
| 6.264335751257797 | 1.666 | 0.833 | 0.556 |
| 6.267477343911387 | 1.666 | 0.833 | 0.556 |
| 6.270618936564976 | 1.666 | 0.833 | 0.556 |
| 6.273760529218566 | 1.667 | 0.833 | 0.556 |
| 6.276902121872155 | 1.667 | 0.833 | 0.556 |
| 6.280043714525745 | 1.667 | 0.833 | 0.556 |
| 6.283185307179335 | 1.667 | 0.833 | 0.556 |